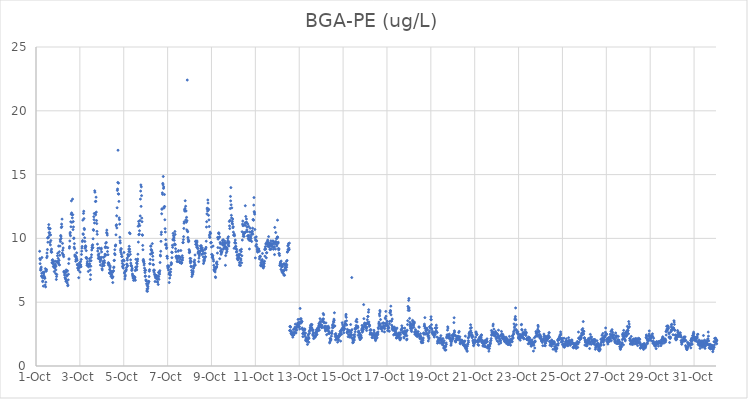
| Category | BGA-PE (ug/L) |
|---|---|
| 44470.166666666664 | 8.99 |
| 44470.177083333336 | 8.42 |
| 44470.1875 | 8.02 |
| 44470.197916666664 | 8.33 |
| 44470.208333333336 | 7.51 |
| 44470.21875 | 7.66 |
| 44470.229166666664 | 7.56 |
| 44470.239583333336 | 7.75 |
| 44470.25 | 7.05 |
| 44470.260416666664 | 7.27 |
| 44470.270833333336 | 8.5 |
| 44470.28125 | 7.02 |
| 44470.291666666664 | 6.93 |
| 44470.302083333336 | 6.61 |
| 44470.3125 | 6.67 |
| 44470.322916666664 | 7.36 |
| 44470.333333333336 | 6.26 |
| 44470.34375 | 7.24 |
| 44470.354166666664 | 7.11 |
| 44470.364583333336 | 6.92 |
| 44470.375 | 7.35 |
| 44470.385416666664 | 6.98 |
| 44470.395833333336 | 6.87 |
| 44470.40625 | 6.89 |
| 44470.416666666664 | 6.35 |
| 44470.427083333336 | 7.63 |
| 44470.4375 | 6.2 |
| 44470.447916666664 | 6.57 |
| 44470.458333333336 | 7.49 |
| 44470.46875 | 7.43 |
| 44470.479166666664 | 7.56 |
| 44470.489583333336 | 8.49 |
| 44470.5 | 8.85 |
| 44470.510416666664 | 8.61 |
| 44470.520833333336 | 9.13 |
| 44470.53125 | 10.03 |
| 44470.541666666664 | 9.7 |
| 44470.552083333336 | 10.07 |
| 44470.5625 | 10.06 |
| 44470.572916666664 | 10.84 |
| 44470.583333333336 | 11.08 |
| 44470.59375 | 10.45 |
| 44470.604166666664 | 10.73 |
| 44470.614583333336 | 10.25 |
| 44470.625 | 10.45 |
| 44470.635416666664 | 9.68 |
| 44470.645833333336 | 10.77 |
| 44470.65625 | 9.49 |
| 44470.666666666664 | 10.27 |
| 44470.677083333336 | 9.83 |
| 44470.6875 | 9.02 |
| 44470.697916666664 | 8.92 |
| 44470.708333333336 | 9.16 |
| 44470.71875 | 8.92 |
| 44470.729166666664 | 8.09 |
| 44470.739583333336 | 8.29 |
| 44470.75 | 8.09 |
| 44470.760416666664 | 8.33 |
| 44470.770833333336 | 8.12 |
| 44470.78125 | 8 |
| 44470.791666666664 | 7.8 |
| 44470.802083333336 | 8.17 |
| 44470.8125 | 7.78 |
| 44470.822916666664 | 7.75 |
| 44470.833333333336 | 7.4 |
| 44470.84375 | 7.9 |
| 44470.854166666664 | 7.67 |
| 44470.864583333336 | 7.71 |
| 44470.875 | 8.21 |
| 44470.885416666664 | 7.99 |
| 44470.895833333336 | 7.24 |
| 44470.90625 | 7.53 |
| 44470.916666666664 | 7.83 |
| 44470.927083333336 | 6.78 |
| 44470.9375 | 7.01 |
| 44470.947916666664 | 7.17 |
| 44470.958333333336 | 8.19 |
| 44470.96875 | 8.17 |
| 44470.979166666664 | 8.64 |
| 44470.989583333336 | 8.83 |
| 44471.0 | 8.1 |
| 44471.010416666664 | 8.43 |
| 44471.020833333336 | 8.13 |
| 44471.03125 | 9.4 |
| 44471.041666666664 | 7.98 |
| 44471.052083333336 | 8.28 |
| 44471.0625 | 8.95 |
| 44471.072916666664 | 7.92 |
| 44471.083333333336 | 8.68 |
| 44471.09375 | 9.4 |
| 44471.104166666664 | 9.89 |
| 44471.114583333336 | 9.75 |
| 44471.125 | 10.23 |
| 44471.135416666664 | 10.16 |
| 44471.145833333336 | 10 |
| 44471.15625 | 10.85 |
| 44471.166666666664 | 11.12 |
| 44471.177083333336 | 10.92 |
| 44471.1875 | 11.51 |
| 44471.197916666664 | 8.85 |
| 44471.208333333336 | 9.61 |
| 44471.21875 | 9.07 |
| 44471.229166666664 | 8.74 |
| 44471.239583333336 | 9.25 |
| 44471.25 | 8.7 |
| 44471.260416666664 | 8.57 |
| 44471.270833333336 | 7.41 |
| 44471.28125 | 7.33 |
| 44471.291666666664 | 7.39 |
| 44471.302083333336 | 7.13 |
| 44471.3125 | 7.35 |
| 44471.322916666664 | 6.93 |
| 44471.333333333336 | 7.31 |
| 44471.34375 | 6.87 |
| 44471.354166666664 | 6.78 |
| 44471.364583333336 | 6.63 |
| 44471.375 | 7.53 |
| 44471.385416666664 | 7.38 |
| 44471.395833333336 | 7.12 |
| 44471.40625 | 6.67 |
| 44471.416666666664 | 7.06 |
| 44471.427083333336 | 6.5 |
| 44471.4375 | 7.46 |
| 44471.447916666664 | 6.29 |
| 44471.458333333336 | 6.34 |
| 44471.46875 | 6.75 |
| 44471.479166666664 | 7.19 |
| 44471.489583333336 | 8.03 |
| 44471.5 | 8.38 |
| 44471.510416666664 | 8.39 |
| 44471.520833333336 | 9.24 |
| 44471.53125 | 9.36 |
| 44471.541666666664 | 9.8 |
| 44471.552083333336 | 10.35 |
| 44471.5625 | 10.47 |
| 44471.572916666664 | 10.21 |
| 44471.583333333336 | 11.3 |
| 44471.59375 | 10.91 |
| 44471.604166666664 | 11.9 |
| 44471.614583333336 | 12.94 |
| 44471.625 | 12 |
| 44471.635416666664 | 11.26 |
| 44471.645833333336 | 11.85 |
| 44471.65625 | 11.61 |
| 44471.666666666664 | 13.08 |
| 44471.677083333336 | 11.86 |
| 44471.6875 | 10.69 |
| 44471.697916666664 | 11.32 |
| 44471.708333333336 | 10.9 |
| 44471.71875 | 9.99 |
| 44471.729166666664 | 10.03 |
| 44471.739583333336 | 9.31 |
| 44471.75 | 9.59 |
| 44471.760416666664 | 9.19 |
| 44471.770833333336 | 8.7 |
| 44471.78125 | 8.59 |
| 44471.791666666664 | 8.66 |
| 44471.802083333336 | 8.59 |
| 44471.8125 | 8.21 |
| 44471.822916666664 | 8.35 |
| 44471.833333333336 | 8.57 |
| 44471.84375 | 8.46 |
| 44471.854166666664 | 8.87 |
| 44471.864583333336 | 8.38 |
| 44471.875 | 8.28 |
| 44471.885416666664 | 7.96 |
| 44471.895833333336 | 7.9 |
| 44471.90625 | 7.69 |
| 44471.916666666664 | 7.66 |
| 44471.927083333336 | 7.64 |
| 44471.9375 | 7.51 |
| 44471.947916666664 | 6.92 |
| 44471.958333333336 | 7.72 |
| 44471.96875 | 8.05 |
| 44471.979166666664 | 7.84 |
| 44471.989583333336 | 7.78 |
| 44472.0 | 7.74 |
| 44472.010416666664 | 7.36 |
| 44472.020833333336 | 7.94 |
| 44472.03125 | 8.17 |
| 44472.041666666664 | 7.92 |
| 44472.052083333336 | 7.78 |
| 44472.0625 | 8.35 |
| 44472.072916666664 | 8.74 |
| 44472.083333333336 | 9 |
| 44472.09375 | 9.24 |
| 44472.104166666664 | 9.37 |
| 44472.114583333336 | 9.75 |
| 44472.125 | 9.83 |
| 44472.135416666664 | 11.43 |
| 44472.145833333336 | 10.36 |
| 44472.15625 | 10.31 |
| 44472.166666666664 | 11.96 |
| 44472.177083333336 | 12.13 |
| 44472.1875 | 11.55 |
| 44472.197916666664 | 10.78 |
| 44472.208333333336 | 10.69 |
| 44472.21875 | 10.05 |
| 44472.229166666664 | 9.76 |
| 44472.239583333336 | 9.22 |
| 44472.25 | 9.31 |
| 44472.260416666664 | 9.42 |
| 44472.270833333336 | 9.35 |
| 44472.28125 | 8.49 |
| 44472.291666666664 | 9.04 |
| 44472.302083333336 | 8.5 |
| 44472.3125 | 8.41 |
| 44472.322916666664 | 7.89 |
| 44472.333333333336 | 8.06 |
| 44472.34375 | 8.19 |
| 44472.354166666664 | 8 |
| 44472.364583333336 | 7.86 |
| 44472.375 | 7.86 |
| 44472.385416666664 | 7.41 |
| 44472.395833333336 | 7.77 |
| 44472.40625 | 7.84 |
| 44472.416666666664 | 7.94 |
| 44472.427083333336 | 7.91 |
| 44472.4375 | 8.41 |
| 44472.447916666664 | 8.02 |
| 44472.458333333336 | 8.25 |
| 44472.46875 | 7.52 |
| 44472.479166666664 | 6.79 |
| 44472.489583333336 | 7.15 |
| 44472.5 | 7.82 |
| 44472.510416666664 | 8.25 |
| 44472.520833333336 | 8.52 |
| 44472.53125 | 8.72 |
| 44472.541666666664 | 9.09 |
| 44472.552083333336 | 9.28 |
| 44472.5625 | 9.43 |
| 44472.572916666664 | 9.25 |
| 44472.583333333336 | 9.5 |
| 44472.59375 | 9.28 |
| 44472.604166666664 | 9.97 |
| 44472.614583333336 | 10.69 |
| 44472.625 | 10.63 |
| 44472.635416666664 | 11.7 |
| 44472.645833333336 | 11.47 |
| 44472.65625 | 11.95 |
| 44472.666666666664 | 11.21 |
| 44472.677083333336 | 13.73 |
| 44472.6875 | 13.62 |
| 44472.697916666664 | 11.97 |
| 44472.708333333336 | 12.89 |
| 44472.71875 | 11.85 |
| 44472.729166666664 | 12.91 |
| 44472.739583333336 | 13.23 |
| 44472.75 | 12.06 |
| 44472.760416666664 | 11.4 |
| 44472.770833333336 | 11.16 |
| 44472.78125 | 10.55 |
| 44472.791666666664 | 10.32 |
| 44472.802083333336 | 9.55 |
| 44472.8125 | 9.01 |
| 44472.822916666664 | 9.22 |
| 44472.833333333336 | 8.7 |
| 44472.84375 | 8.43 |
| 44472.854166666664 | 8.43 |
| 44472.864583333336 | 8.57 |
| 44472.875 | 8.8 |
| 44472.885416666664 | 9.24 |
| 44472.895833333336 | 8.55 |
| 44472.90625 | 8.43 |
| 44472.916666666664 | 8.33 |
| 44472.927083333336 | 8.16 |
| 44472.9375 | 7.91 |
| 44472.947916666664 | 8.44 |
| 44472.958333333336 | 8.31 |
| 44472.96875 | 9.13 |
| 44472.979166666664 | 9.23 |
| 44472.989583333336 | 8.94 |
| 44473.0 | 8.52 |
| 44473.010416666664 | 7.62 |
| 44473.020833333336 | 7.53 |
| 44473.03125 | 7.82 |
| 44473.041666666664 | 8.01 |
| 44473.052083333336 | 7.99 |
| 44473.0625 | 8.2 |
| 44473.072916666664 | 8.06 |
| 44473.083333333336 | 8.51 |
| 44473.09375 | 8.17 |
| 44473.104166666664 | 7.88 |
| 44473.114583333336 | 8.26 |
| 44473.125 | 8.1 |
| 44473.135416666664 | 8.6 |
| 44473.145833333336 | 8.76 |
| 44473.15625 | 9.28 |
| 44473.166666666664 | 9.35 |
| 44473.177083333336 | 9.62 |
| 44473.1875 | 8.7 |
| 44473.197916666664 | 9.3 |
| 44473.208333333336 | 9.68 |
| 44473.21875 | 10.46 |
| 44473.229166666664 | 10.65 |
| 44473.239583333336 | 10.39 |
| 44473.25 | 10.26 |
| 44473.260416666664 | 8.97 |
| 44473.270833333336 | 9.27 |
| 44473.28125 | 8.72 |
| 44473.291666666664 | 8.02 |
| 44473.302083333336 | 8.1 |
| 44473.3125 | 7.89 |
| 44473.322916666664 | 8.04 |
| 44473.333333333336 | 7.97 |
| 44473.34375 | 7.29 |
| 44473.354166666664 | 7.56 |
| 44473.364583333336 | 7.27 |
| 44473.375 | 7.7 |
| 44473.385416666664 | 7.83 |
| 44473.395833333336 | 7.46 |
| 44473.40625 | 7.31 |
| 44473.416666666664 | 7.03 |
| 44473.427083333336 | 7.17 |
| 44473.4375 | 7.36 |
| 44473.447916666664 | 7.38 |
| 44473.458333333336 | 7.13 |
| 44473.46875 | 6.91 |
| 44473.479166666664 | 6.91 |
| 44473.489583333336 | 7.33 |
| 44473.5 | 6.54 |
| 44473.510416666664 | 6.99 |
| 44473.520833333336 | 7.42 |
| 44473.53125 | 7.47 |
| 44473.541666666664 | 7.71 |
| 44473.552083333336 | 7.76 |
| 44473.5625 | 8.26 |
| 44473.572916666664 | 8.28 |
| 44473.583333333336 | 8.81 |
| 44473.59375 | 9.11 |
| 44473.604166666664 | 8.72 |
| 44473.614583333336 | 9.41 |
| 44473.625 | 9.43 |
| 44473.635416666664 | 9.49 |
| 44473.645833333336 | 10.28 |
| 44473.65625 | 10.99 |
| 44473.666666666664 | 11.07 |
| 44473.677083333336 | 11.77 |
| 44473.6875 | 10.82 |
| 44473.697916666664 | 12.4 |
| 44473.708333333336 | 13.76 |
| 44473.71875 | 13.87 |
| 44473.729166666664 | 14.38 |
| 44473.739583333336 | 16.91 |
| 44473.75 | 13.49 |
| 44473.760416666664 | 14.33 |
| 44473.770833333336 | 13.47 |
| 44473.78125 | 12.9 |
| 44473.791666666664 | 11.61 |
| 44473.802083333336 | 11.47 |
| 44473.8125 | 11.12 |
| 44473.822916666664 | 10.09 |
| 44473.833333333336 | 9.81 |
| 44473.84375 | 9.65 |
| 44473.854166666664 | 9.08 |
| 44473.864583333336 | 8.93 |
| 44473.875 | 9.2 |
| 44473.885416666664 | 9.17 |
| 44473.895833333336 | 8.77 |
| 44473.90625 | 8.58 |
| 44473.916666666664 | 8.58 |
| 44473.927083333336 | 8.24 |
| 44473.9375 | 8.04 |
| 44473.947916666664 | 7.82 |
| 44473.958333333336 | 7.75 |
| 44473.96875 | 8.27 |
| 44473.979166666664 | 7.67 |
| 44473.989583333336 | 8.31 |
| 44474.0 | 7.91 |
| 44474.010416666664 | 8.9 |
| 44474.020833333336 | 8.24 |
| 44474.03125 | 7.28 |
| 44474.041666666664 | 7.35 |
| 44474.052083333336 | 6.82 |
| 44474.0625 | 7.01 |
| 44474.072916666664 | 7.12 |
| 44474.083333333336 | 7.44 |
| 44474.09375 | 7.46 |
| 44474.104166666664 | 7.46 |
| 44474.114583333336 | 7.57 |
| 44474.125 | 7.72 |
| 44474.135416666664 | 7.96 |
| 44474.145833333336 | 7.99 |
| 44474.15625 | 8.45 |
| 44474.166666666664 | 8.3 |
| 44474.177083333336 | 7.84 |
| 44474.1875 | 8.74 |
| 44474.197916666664 | 8.69 |
| 44474.208333333336 | 8.61 |
| 44474.21875 | 8.62 |
| 44474.229166666664 | 9.16 |
| 44474.239583333336 | 8.97 |
| 44474.25 | 9.38 |
| 44474.260416666664 | 10.44 |
| 44474.270833333336 | 9.16 |
| 44474.28125 | 8.96 |
| 44474.291666666664 | 10.37 |
| 44474.302083333336 | 8.75 |
| 44474.3125 | 8.32 |
| 44474.322916666664 | 8.06 |
| 44474.333333333336 | 7.86 |
| 44474.34375 | 7.89 |
| 44474.354166666664 | 7.81 |
| 44474.364583333336 | 7.48 |
| 44474.375 | 7.56 |
| 44474.385416666664 | 7.66 |
| 44474.395833333336 | 7.21 |
| 44474.40625 | 7.11 |
| 44474.416666666664 | 7.01 |
| 44474.427083333336 | 6.89 |
| 44474.4375 | 6.92 |
| 44474.447916666664 | 6.71 |
| 44474.458333333336 | 7.04 |
| 44474.46875 | 6.86 |
| 44474.479166666664 | 6.89 |
| 44474.489583333336 | 6.75 |
| 44474.5 | 6.99 |
| 44474.510416666664 | 6.93 |
| 44474.520833333336 | 7.48 |
| 44474.53125 | 6.72 |
| 44474.541666666664 | 7.74 |
| 44474.552083333336 | 8.36 |
| 44474.5625 | 7.56 |
| 44474.572916666664 | 7.68 |
| 44474.583333333336 | 8.07 |
| 44474.59375 | 7.53 |
| 44474.604166666664 | 7.8 |
| 44474.614583333336 | 8.01 |
| 44474.625 | 8.22 |
| 44474.635416666664 | 8.38 |
| 44474.645833333336 | 8.76 |
| 44474.65625 | 10.95 |
| 44474.666666666664 | 9.71 |
| 44474.677083333336 | 11.33 |
| 44474.6875 | 10.29 |
| 44474.697916666664 | 11.13 |
| 44474.708333333336 | 10.33 |
| 44474.71875 | 10.6 |
| 44474.729166666664 | 11 |
| 44474.739583333336 | 11.4 |
| 44474.75 | 11.76 |
| 44474.760416666664 | 13.08 |
| 44474.770833333336 | 13.71 |
| 44474.78125 | 14.19 |
| 44474.791666666664 | 12.51 |
| 44474.802083333336 | 14.04 |
| 44474.8125 | 13.35 |
| 44474.822916666664 | 11.59 |
| 44474.833333333336 | 11.31 |
| 44474.84375 | 10.28 |
| 44474.854166666664 | 10.24 |
| 44474.864583333336 | 9.45 |
| 44474.875 | 9.11 |
| 44474.885416666664 | 8.26 |
| 44474.895833333336 | 8.35 |
| 44474.90625 | 8.15 |
| 44474.916666666664 | 8.21 |
| 44474.927083333336 | 7.91 |
| 44474.9375 | 8.03 |
| 44474.947916666664 | 7.67 |
| 44474.958333333336 | 7.48 |
| 44474.96875 | 7.32 |
| 44474.979166666664 | 7.02 |
| 44474.989583333336 | 7.06 |
| 44475.0 | 7.5 |
| 44475.010416666664 | 6.75 |
| 44475.020833333336 | 6.71 |
| 44475.03125 | 6.65 |
| 44475.041666666664 | 6.44 |
| 44475.052083333336 | 5.88 |
| 44475.0625 | 6.04 |
| 44475.072916666664 | 6.3 |
| 44475.083333333336 | 5.85 |
| 44475.09375 | 6.06 |
| 44475.104166666664 | 6.21 |
| 44475.114583333336 | 6.44 |
| 44475.125 | 6.58 |
| 44475.135416666664 | 6.63 |
| 44475.145833333336 | 6.62 |
| 44475.15625 | 7.01 |
| 44475.166666666664 | 7.43 |
| 44475.177083333336 | 7.55 |
| 44475.1875 | 8.01 |
| 44475.197916666664 | 8.01 |
| 44475.208333333336 | 8.35 |
| 44475.21875 | 8.77 |
| 44475.229166666664 | 9.4 |
| 44475.239583333336 | 9.39 |
| 44475.25 | 9.13 |
| 44475.260416666664 | 9.07 |
| 44475.270833333336 | 9.05 |
| 44475.28125 | 8.81 |
| 44475.291666666664 | 8.85 |
| 44475.302083333336 | 9.59 |
| 44475.3125 | 8.89 |
| 44475.322916666664 | 8.6 |
| 44475.333333333336 | 8.31 |
| 44475.34375 | 7.95 |
| 44475.354166666664 | 7.94 |
| 44475.364583333336 | 7.46 |
| 44475.375 | 7.53 |
| 44475.385416666664 | 7.35 |
| 44475.395833333336 | 7.5 |
| 44475.40625 | 7.2 |
| 44475.416666666664 | 7.13 |
| 44475.427083333336 | 6.62 |
| 44475.4375 | 7.03 |
| 44475.447916666664 | 6.91 |
| 44475.458333333336 | 7.11 |
| 44475.46875 | 7.08 |
| 44475.479166666664 | 7.08 |
| 44475.489583333336 | 6.92 |
| 44475.5 | 6.87 |
| 44475.510416666664 | 7.07 |
| 44475.520833333336 | 6.81 |
| 44475.53125 | 6.62 |
| 44475.541666666664 | 6.56 |
| 44475.552083333336 | 6.83 |
| 44475.5625 | 7.06 |
| 44475.572916666664 | 6.39 |
| 44475.583333333336 | 7.33 |
| 44475.59375 | 7 |
| 44475.604166666664 | 6.79 |
| 44475.614583333336 | 7.31 |
| 44475.625 | 7.38 |
| 44475.635416666664 | 7.2 |
| 44475.645833333336 | 7.47 |
| 44475.65625 | 8.11 |
| 44475.666666666664 | 8.69 |
| 44475.677083333336 | 8.62 |
| 44475.6875 | 8.99 |
| 44475.697916666664 | 9.77 |
| 44475.708333333336 | 10.31 |
| 44475.71875 | 10.49 |
| 44475.729166666664 | 11.93 |
| 44475.739583333336 | 12.28 |
| 44475.75 | 12.33 |
| 44475.760416666664 | 13.57 |
| 44475.770833333336 | 13.45 |
| 44475.78125 | 14.31 |
| 44475.791666666664 | 14.2 |
| 44475.802083333336 | 14.85 |
| 44475.8125 | 13.92 |
| 44475.822916666664 | 14.03 |
| 44475.833333333336 | 12.38 |
| 44475.84375 | 12.48 |
| 44475.854166666664 | 13.44 |
| 44475.864583333336 | 12.5 |
| 44475.875 | 11.46 |
| 44475.885416666664 | 10.76 |
| 44475.895833333336 | 10.5 |
| 44475.90625 | 9.5 |
| 44475.916666666664 | 9.9 |
| 44475.927083333336 | 9.57 |
| 44475.9375 | 9.47 |
| 44475.947916666664 | 9.21 |
| 44475.958333333336 | 9.28 |
| 44475.96875 | 8.6 |
| 44475.979166666664 | 8.6 |
| 44475.989583333336 | 8.44 |
| 44476.0 | 7.83 |
| 44476.010416666664 | 7.68 |
| 44476.020833333336 | 7.86 |
| 44476.03125 | 7.73 |
| 44476.041666666664 | 7.52 |
| 44476.052083333336 | 7.81 |
| 44476.0625 | 7.2 |
| 44476.072916666664 | 6.54 |
| 44476.083333333336 | 7.3 |
| 44476.09375 | 6.89 |
| 44476.104166666664 | 7.29 |
| 44476.114583333336 | 7.15 |
| 44476.125 | 7.11 |
| 44476.135416666664 | 7.38 |
| 44476.145833333336 | 7.59 |
| 44476.15625 | 7.93 |
| 44476.166666666664 | 8.1 |
| 44476.177083333336 | 8.01 |
| 44476.1875 | 8.92 |
| 44476.197916666664 | 8.49 |
| 44476.208333333336 | 8.89 |
| 44476.21875 | 9.46 |
| 44476.229166666664 | 9.3 |
| 44476.239583333336 | 9.89 |
| 44476.25 | 10.39 |
| 44476.260416666664 | 9.89 |
| 44476.270833333336 | 10.21 |
| 44476.28125 | 10.01 |
| 44476.291666666664 | 10.1 |
| 44476.302083333336 | 9.85 |
| 44476.3125 | 9.5 |
| 44476.322916666664 | 9.57 |
| 44476.333333333336 | 10.54 |
| 44476.34375 | 10.31 |
| 44476.354166666664 | 9.51 |
| 44476.364583333336 | 9.19 |
| 44476.375 | 8.96 |
| 44476.385416666664 | 8.55 |
| 44476.395833333336 | 8.58 |
| 44476.40625 | 8.61 |
| 44476.416666666664 | 8.41 |
| 44476.427083333336 | 8.6 |
| 44476.4375 | 8.18 |
| 44476.447916666664 | 8.21 |
| 44476.458333333336 | 8.57 |
| 44476.46875 | 8.42 |
| 44476.479166666664 | 8.99 |
| 44476.489583333336 | 8.54 |
| 44476.5 | 9.05 |
| 44476.510416666664 | 8.61 |
| 44476.520833333336 | 8.56 |
| 44476.53125 | 8.19 |
| 44476.541666666664 | 8.16 |
| 44476.552083333336 | 8.12 |
| 44476.5625 | 8.11 |
| 44476.572916666664 | 8.37 |
| 44476.583333333336 | 8.14 |
| 44476.59375 | 8.51 |
| 44476.604166666664 | 9.05 |
| 44476.614583333336 | 8.1 |
| 44476.625 | 8.04 |
| 44476.635416666664 | 8.09 |
| 44476.645833333336 | 8.08 |
| 44476.65625 | 8.33 |
| 44476.666666666664 | 8.64 |
| 44476.677083333336 | 8.29 |
| 44476.6875 | 8.48 |
| 44476.697916666664 | 9.67 |
| 44476.708333333336 | 9.67 |
| 44476.71875 | 9.9 |
| 44476.729166666664 | 10.14 |
| 44476.739583333336 | 10.78 |
| 44476.75 | 11.19 |
| 44476.760416666664 | 11.31 |
| 44476.770833333336 | 12.24 |
| 44476.78125 | 12.14 |
| 44476.791666666664 | 12.34 |
| 44476.802083333336 | 12.95 |
| 44476.8125 | 12.16 |
| 44476.822916666664 | 12.52 |
| 44476.833333333336 | 11.46 |
| 44476.84375 | 12.15 |
| 44476.854166666664 | 11.27 |
| 44476.864583333336 | 11.65 |
| 44476.875 | 10.67 |
| 44476.885416666664 | 11.38 |
| 44476.895833333336 | 22.41 |
| 44476.90625 | 10.57 |
| 44476.916666666664 | 10.52 |
| 44476.927083333336 | 10.07 |
| 44476.9375 | 9.94 |
| 44476.947916666664 | 9.74 |
| 44476.958333333336 | 9.82 |
| 44476.96875 | 9.79 |
| 44476.979166666664 | 9.12 |
| 44476.989583333336 | 8.88 |
| 44477.0 | 9.02 |
| 44477.010416666664 | 8.93 |
| 44477.020833333336 | 8.43 |
| 44477.03125 | 8.22 |
| 44477.041666666664 | 8.08 |
| 44477.052083333336 | 8.42 |
| 44477.0625 | 7.81 |
| 44477.072916666664 | 8.2 |
| 44477.083333333336 | 7.78 |
| 44477.09375 | 7.49 |
| 44477.104166666664 | 7.01 |
| 44477.114583333336 | 7.33 |
| 44477.125 | 7.15 |
| 44477.135416666664 | 7.32 |
| 44477.145833333336 | 7.19 |
| 44477.15625 | 7.31 |
| 44477.166666666664 | 7.44 |
| 44477.177083333336 | 7.65 |
| 44477.1875 | 7.85 |
| 44477.197916666664 | 7.76 |
| 44477.208333333336 | 8.16 |
| 44477.21875 | 8.12 |
| 44477.229166666664 | 8.3 |
| 44477.239583333336 | 7.98 |
| 44477.25 | 8.7 |
| 44477.260416666664 | 7.9 |
| 44477.270833333336 | 9.75 |
| 44477.28125 | 9.53 |
| 44477.291666666664 | 9.8 |
| 44477.302083333336 | 9.55 |
| 44477.3125 | 9.73 |
| 44477.322916666664 | 9.32 |
| 44477.333333333336 | 9.66 |
| 44477.34375 | 9.79 |
| 44477.354166666664 | 9.46 |
| 44477.364583333336 | 9.3 |
| 44477.375 | 9.19 |
| 44477.385416666664 | 8.85 |
| 44477.395833333336 | 8.93 |
| 44477.40625 | 8.98 |
| 44477.416666666664 | 8.18 |
| 44477.427083333336 | 8.45 |
| 44477.4375 | 8.75 |
| 44477.447916666664 | 8.63 |
| 44477.458333333336 | 8.84 |
| 44477.46875 | 8.98 |
| 44477.479166666664 | 9.02 |
| 44477.489583333336 | 8.97 |
| 44477.5 | 9.41 |
| 44477.510416666664 | 9.22 |
| 44477.520833333336 | 9.38 |
| 44477.53125 | 9.43 |
| 44477.541666666664 | 9.24 |
| 44477.552083333336 | 9.12 |
| 44477.5625 | 8.74 |
| 44477.572916666664 | 9.09 |
| 44477.583333333336 | 9.25 |
| 44477.59375 | 9.06 |
| 44477.604166666664 | 8.82 |
| 44477.614583333336 | 9.01 |
| 44477.625 | 8.55 |
| 44477.635416666664 | 8.03 |
| 44477.645833333336 | 8.3 |
| 44477.65625 | 8.17 |
| 44477.666666666664 | 8.82 |
| 44477.677083333336 | 8.26 |
| 44477.6875 | 8.4 |
| 44477.697916666664 | 9.13 |
| 44477.708333333336 | 8.56 |
| 44477.71875 | 8.84 |
| 44477.729166666664 | 8.56 |
| 44477.739583333336 | 9.18 |
| 44477.75 | 9.3 |
| 44477.760416666664 | 9.78 |
| 44477.770833333336 | 10.89 |
| 44477.78125 | 11.31 |
| 44477.791666666664 | 11.92 |
| 44477.802083333336 | 12.37 |
| 44477.8125 | 12.27 |
| 44477.822916666664 | 12.14 |
| 44477.833333333336 | 13.01 |
| 44477.84375 | 12.77 |
| 44477.854166666664 | 12.31 |
| 44477.864583333336 | 11.81 |
| 44477.875 | 12.25 |
| 44477.885416666664 | 11.45 |
| 44477.895833333336 | 10.93 |
| 44477.90625 | 10.26 |
| 44477.916666666664 | 10.11 |
| 44477.927083333336 | 10.07 |
| 44477.9375 | 10.49 |
| 44477.947916666664 | 10.39 |
| 44477.958333333336 | 10.39 |
| 44477.96875 | 9.65 |
| 44477.979166666664 | 9.67 |
| 44477.989583333336 | 9.67 |
| 44478.0 | 9.32 |
| 44478.010416666664 | 8.75 |
| 44478.020833333336 | 8.72 |
| 44478.03125 | 8.5 |
| 44478.041666666664 | 8.61 |
| 44478.052083333336 | 8.52 |
| 44478.0625 | 8.64 |
| 44478.072916666664 | 9.4 |
| 44478.083333333336 | 8.37 |
| 44478.09375 | 8.22 |
| 44478.104166666664 | 7.89 |
| 44478.114583333336 | 7.56 |
| 44478.125 | 7.47 |
| 44478.135416666664 | 7.73 |
| 44478.145833333336 | 7.46 |
| 44478.15625 | 7.5 |
| 44478.166666666664 | 7.37 |
| 44478.177083333336 | 6.99 |
| 44478.1875 | 6.93 |
| 44478.197916666664 | 7.63 |
| 44478.208333333336 | 7.73 |
| 44478.21875 | 8.06 |
| 44478.229166666664 | 7.77 |
| 44478.239583333336 | 7.76 |
| 44478.25 | 8.16 |
| 44478.260416666664 | 7.96 |
| 44478.270833333336 | 8.85 |
| 44478.28125 | 10.08 |
| 44478.291666666664 | 9.28 |
| 44478.302083333336 | 9.94 |
| 44478.3125 | 10.07 |
| 44478.322916666664 | 10.39 |
| 44478.333333333336 | 10.44 |
| 44478.34375 | 10.37 |
| 44478.354166666664 | 10.06 |
| 44478.364583333336 | 10.13 |
| 44478.375 | 8.41 |
| 44478.385416666664 | 9.25 |
| 44478.395833333336 | 9.68 |
| 44478.40625 | 9.58 |
| 44478.416666666664 | 9 |
| 44478.427083333336 | 9 |
| 44478.4375 | 8.75 |
| 44478.447916666664 | 8.85 |
| 44478.458333333336 | 8.89 |
| 44478.46875 | 9.13 |
| 44478.479166666664 | 8.95 |
| 44478.489583333336 | 9.54 |
| 44478.5 | 9.83 |
| 44478.510416666664 | 9.69 |
| 44478.520833333336 | 9.47 |
| 44478.53125 | 9.9 |
| 44478.541666666664 | 9.15 |
| 44478.552083333336 | 9.49 |
| 44478.5625 | 9.65 |
| 44478.572916666664 | 9.26 |
| 44478.583333333336 | 9.51 |
| 44478.59375 | 9.31 |
| 44478.604166666664 | 9.79 |
| 44478.614583333336 | 9.63 |
| 44478.625 | 9.39 |
| 44478.635416666664 | 7.89 |
| 44478.645833333336 | 8.65 |
| 44478.65625 | 9.62 |
| 44478.666666666664 | 9.15 |
| 44478.677083333336 | 8.87 |
| 44478.6875 | 9.29 |
| 44478.697916666664 | 9.23 |
| 44478.708333333336 | 8.99 |
| 44478.71875 | 9.16 |
| 44478.729166666664 | 9.72 |
| 44478.739583333336 | 10.01 |
| 44478.75 | 9.84 |
| 44478.760416666664 | 9.49 |
| 44478.770833333336 | 10.13 |
| 44478.78125 | 9.59 |
| 44478.791666666664 | 9.4 |
| 44478.802083333336 | 9.71 |
| 44478.8125 | 11.33 |
| 44478.822916666664 | 10.98 |
| 44478.833333333336 | 10.77 |
| 44478.84375 | 11.41 |
| 44478.854166666664 | 12.34 |
| 44478.864583333336 | 13.29 |
| 44478.875 | 12.94 |
| 44478.885416666664 | 13.98 |
| 44478.895833333336 | 12.63 |
| 44478.90625 | 11.81 |
| 44478.916666666664 | 11.6 |
| 44478.927083333336 | 12.39 |
| 44478.9375 | 11.2 |
| 44478.947916666664 | 11.34 |
| 44478.958333333336 | 11.13 |
| 44478.96875 | 11.52 |
| 44478.979166666664 | 10.84 |
| 44478.989583333336 | 10.92 |
| 44479.0 | 10.49 |
| 44479.010416666664 | 10.25 |
| 44479.020833333336 | 10.26 |
| 44479.03125 | 9.22 |
| 44479.041666666664 | 10.33 |
| 44479.052083333336 | 10.21 |
| 44479.0625 | 9.65 |
| 44479.072916666664 | 9.68 |
| 44479.083333333336 | 9.87 |
| 44479.09375 | 9.36 |
| 44479.104166666664 | 9.62 |
| 44479.114583333336 | 9.37 |
| 44479.125 | 9.18 |
| 44479.135416666664 | 8.93 |
| 44479.145833333336 | 9.13 |
| 44479.15625 | 8.97 |
| 44479.166666666664 | 8.66 |
| 44479.177083333336 | 8.44 |
| 44479.1875 | 8.71 |
| 44479.197916666664 | 8.35 |
| 44479.208333333336 | 8.31 |
| 44479.21875 | 8.38 |
| 44479.229166666664 | 8.49 |
| 44479.239583333336 | 8.62 |
| 44479.25 | 8.49 |
| 44479.260416666664 | 8.77 |
| 44479.270833333336 | 7.9 |
| 44479.28125 | 8.08 |
| 44479.291666666664 | 8.13 |
| 44479.302083333336 | 9.07 |
| 44479.3125 | 8.73 |
| 44479.322916666664 | 7.88 |
| 44479.333333333336 | 8.41 |
| 44479.34375 | 8.3 |
| 44479.354166666664 | 8.96 |
| 44479.364583333336 | 9.15 |
| 44479.375 | 8.09 |
| 44479.385416666664 | 8.64 |
| 44479.395833333336 | 10.52 |
| 44479.40625 | 9.87 |
| 44479.416666666664 | 11.12 |
| 44479.427083333336 | 11.36 |
| 44479.4375 | 10.99 |
| 44479.447916666664 | 10.17 |
| 44479.458333333336 | 10.32 |
| 44479.46875 | 10.36 |
| 44479.479166666664 | 10.46 |
| 44479.489583333336 | 10.16 |
| 44479.5 | 11.04 |
| 44479.510416666664 | 10.42 |
| 44479.520833333336 | 10.43 |
| 44479.53125 | 11.22 |
| 44479.541666666664 | 12.56 |
| 44479.552083333336 | 11.02 |
| 44479.5625 | 11.72 |
| 44479.572916666664 | 10.52 |
| 44479.583333333336 | 11.26 |
| 44479.59375 | 11.52 |
| 44479.604166666664 | 11.25 |
| 44479.614583333336 | 10.67 |
| 44479.625 | 10.89 |
| 44479.635416666664 | 10.54 |
| 44479.645833333336 | 10.18 |
| 44479.65625 | 11.12 |
| 44479.666666666664 | 10.21 |
| 44479.677083333336 | 9.98 |
| 44479.6875 | 9.99 |
| 44479.697916666664 | 10.94 |
| 44479.708333333336 | 10.23 |
| 44479.71875 | 9.85 |
| 44479.729166666664 | 9.17 |
| 44479.739583333336 | 10.5 |
| 44479.75 | 10.02 |
| 44479.760416666664 | 10.8 |
| 44479.770833333336 | 9.84 |
| 44479.78125 | 9.84 |
| 44479.791666666664 | 10.15 |
| 44479.802083333336 | 10 |
| 44479.8125 | 10.5 |
| 44479.822916666664 | 10.31 |
| 44479.833333333336 | 9.76 |
| 44479.84375 | 10.36 |
| 44479.854166666664 | 10.58 |
| 44479.864583333336 | 10.51 |
| 44479.875 | 10.8 |
| 44479.885416666664 | 10.33 |
| 44479.895833333336 | 11.46 |
| 44479.90625 | 11.48 |
| 44479.916666666664 | 11.42 |
| 44479.927083333336 | 12.61 |
| 44479.9375 | 13.2 |
| 44479.947916666664 | 12.1 |
| 44479.958333333336 | 12.02 |
| 44479.96875 | 11.9 |
| 44479.979166666664 | 10.7 |
| 44479.989583333336 | 10.06 |
| 44480.0 | 8.47 |
| 44480.010416666664 | 9.88 |
| 44480.020833333336 | 9.41 |
| 44480.03125 | 9.86 |
| 44480.041666666664 | 10.12 |
| 44480.052083333336 | 9.53 |
| 44480.0625 | 9.8 |
| 44480.072916666664 | 9.33 |
| 44480.083333333336 | 9.16 |
| 44480.09375 | 9.01 |
| 44480.104166666664 | 8.92 |
| 44480.114583333336 | 9.08 |
| 44480.125 | 8.99 |
| 44480.135416666664 | 9.12 |
| 44480.145833333336 | 9.17 |
| 44480.15625 | 9.17 |
| 44480.166666666664 | 9 |
| 44480.177083333336 | 9.01 |
| 44480.1875 | 8.39 |
| 44480.197916666664 | 8.55 |
| 44480.208333333336 | 8.54 |
| 44480.21875 | 8.61 |
| 44480.229166666664 | 8.58 |
| 44480.239583333336 | 7.89 |
| 44480.25 | 8.08 |
| 44480.260416666664 | 7.83 |
| 44480.270833333336 | 7.94 |
| 44480.28125 | 8.26 |
| 44480.291666666664 | 7.93 |
| 44480.302083333336 | 8.21 |
| 44480.3125 | 8.34 |
| 44480.322916666664 | 8.82 |
| 44480.333333333336 | 7.82 |
| 44480.34375 | 7.77 |
| 44480.354166666664 | 8.07 |
| 44480.364583333336 | 7.68 |
| 44480.375 | 7.93 |
| 44480.385416666664 | 8.17 |
| 44480.395833333336 | 7.8 |
| 44480.40625 | 8.05 |
| 44480.416666666664 | 8.21 |
| 44480.427083333336 | 9.12 |
| 44480.4375 | 8.61 |
| 44480.447916666664 | 9.21 |
| 44480.458333333336 | 9.35 |
| 44480.46875 | 9.15 |
| 44480.479166666664 | 9.56 |
| 44480.489583333336 | 9.61 |
| 44480.5 | 8.48 |
| 44480.510416666664 | 8.87 |
| 44480.520833333336 | 8.88 |
| 44480.53125 | 9.59 |
| 44480.541666666664 | 9.76 |
| 44480.552083333336 | 9.4 |
| 44480.5625 | 9.87 |
| 44480.572916666664 | 9.58 |
| 44480.583333333336 | 9.71 |
| 44480.59375 | 9.65 |
| 44480.604166666664 | 10.14 |
| 44480.614583333336 | 9.65 |
| 44480.625 | 9.32 |
| 44480.635416666664 | 9.44 |
| 44480.645833333336 | 9.56 |
| 44480.65625 | 9.44 |
| 44480.666666666664 | 9.15 |
| 44480.677083333336 | 9.13 |
| 44480.6875 | 9.48 |
| 44480.697916666664 | 9.63 |
| 44480.708333333336 | 9.81 |
| 44480.71875 | 9.37 |
| 44480.729166666664 | 9.17 |
| 44480.739583333336 | 9.55 |
| 44480.75 | 9.56 |
| 44480.760416666664 | 9.46 |
| 44480.770833333336 | 9.52 |
| 44480.78125 | 9.56 |
| 44480.791666666664 | 9.79 |
| 44480.802083333336 | 9.33 |
| 44480.8125 | 9.79 |
| 44480.822916666664 | 9.15 |
| 44480.833333333336 | 9.74 |
| 44480.84375 | 9.63 |
| 44480.854166666664 | 9.3 |
| 44480.864583333336 | 9.35 |
| 44480.875 | 8.73 |
| 44480.885416666664 | 10.86 |
| 44480.895833333336 | 9.57 |
| 44480.90625 | 9.72 |
| 44480.916666666664 | 9.16 |
| 44480.927083333336 | 10.46 |
| 44480.9375 | 9.75 |
| 44480.947916666664 | 9.7 |
| 44480.958333333336 | 9.98 |
| 44480.96875 | 9.51 |
| 44480.979166666664 | 9.41 |
| 44480.989583333336 | 10.01 |
| 44481.0 | 10.11 |
| 44481.010416666664 | 11.43 |
| 44481.020833333336 | 10.1 |
| 44481.03125 | 9.61 |
| 44481.041666666664 | 9.7 |
| 44481.052083333336 | 9.21 |
| 44481.0625 | 9.1 |
| 44481.072916666664 | 8.81 |
| 44481.083333333336 | 9.17 |
| 44481.09375 | 8.81 |
| 44481.104166666664 | 8.66 |
| 44481.114583333336 | 7.88 |
| 44481.125 | 7.91 |
| 44481.135416666664 | 8.05 |
| 44481.145833333336 | 8.15 |
| 44481.15625 | 8.01 |
| 44481.166666666664 | 7.57 |
| 44481.177083333336 | 8.22 |
| 44481.1875 | 7.87 |
| 44481.197916666664 | 7.75 |
| 44481.208333333336 | 7.38 |
| 44481.21875 | 7.49 |
| 44481.229166666664 | 7.91 |
| 44481.239583333336 | 7.81 |
| 44481.25 | 7.43 |
| 44481.260416666664 | 7.29 |
| 44481.270833333336 | 7.25 |
| 44481.28125 | 8 |
| 44481.291666666664 | 7.46 |
| 44481.302083333336 | 7.12 |
| 44481.3125 | 7.5 |
| 44481.322916666664 | 8.01 |
| 44481.333333333336 | 7.11 |
| 44481.34375 | 7.94 |
| 44481.354166666664 | 7.67 |
| 44481.364583333336 | 7.73 |
| 44481.375 | 7.92 |
| 44481.385416666664 | 7.76 |
| 44481.395833333336 | 8.01 |
| 44481.40625 | 7.53 |
| 44481.416666666664 | 8.2 |
| 44481.427083333336 | 7.74 |
| 44481.4375 | 7.92 |
| 44481.447916666664 | 8.27 |
| 44481.458333333336 | 8.92 |
| 44481.46875 | 8.97 |
| 44481.479166666664 | 9.41 |
| 44481.489583333336 | 9.13 |
| 44481.5 | 9.46 |
| 44481.510416666664 | 9.59 |
| 44481.520833333336 | 9.09 |
| 44481.53125 | 9.24 |
| 44481.541666666664 | 9.12 |
| 44481.552083333336 | 9.63 |
| 44481.5625 | 2.78 |
| 44481.572916666664 | 3.09 |
| 44481.583333333336 | 2.78 |
| 44481.59375 | 3.1 |
| 44481.604166666664 | 3.04 |
| 44481.614583333336 | 2.71 |
| 44481.625 | 2.57 |
| 44481.635416666664 | 2.52 |
| 44481.645833333336 | 2.73 |
| 44481.65625 | 2.55 |
| 44481.666666666664 | 2.44 |
| 44481.677083333336 | 2.57 |
| 44481.6875 | 2.42 |
| 44481.697916666664 | 2.5 |
| 44481.708333333336 | 2.26 |
| 44481.71875 | 2.58 |
| 44481.729166666664 | 2.41 |
| 44481.739583333336 | 2.87 |
| 44481.75 | 2.62 |
| 44481.760416666664 | 2.45 |
| 44481.770833333336 | 2.87 |
| 44481.78125 | 2.6 |
| 44481.791666666664 | 2.94 |
| 44481.802083333336 | 3.04 |
| 44481.8125 | 2.65 |
| 44481.822916666664 | 3.28 |
| 44481.833333333336 | 2.87 |
| 44481.84375 | 2.88 |
| 44481.854166666664 | 2.59 |
| 44481.864583333336 | 2.92 |
| 44481.875 | 3.03 |
| 44481.885416666664 | 2.8 |
| 44481.895833333336 | 3.06 |
| 44481.90625 | 3.23 |
| 44481.916666666664 | 3.23 |
| 44481.927083333336 | 3.29 |
| 44481.9375 | 3.38 |
| 44481.947916666664 | 3.65 |
| 44481.958333333336 | 3.16 |
| 44481.96875 | 3.1 |
| 44481.979166666664 | 3.07 |
| 44481.989583333336 | 3.23 |
| 44482.0 | 3.44 |
| 44482.010416666664 | 3.08 |
| 44482.020833333336 | 2.9 |
| 44482.03125 | 3.37 |
| 44482.041666666664 | 4.51 |
| 44482.052083333336 | 3.68 |
| 44482.0625 | 3.37 |
| 44482.072916666664 | 3.66 |
| 44482.083333333336 | 3.71 |
| 44482.09375 | 3.38 |
| 44482.104166666664 | 3.47 |
| 44482.114583333336 | 3.48 |
| 44482.125 | 3.49 |
| 44482.135416666664 | 2.98 |
| 44482.145833333336 | 2.9 |
| 44482.15625 | 2.54 |
| 44482.166666666664 | 2.3 |
| 44482.177083333336 | 2.81 |
| 44482.1875 | 2.54 |
| 44482.197916666664 | 2.64 |
| 44482.208333333336 | 2.57 |
| 44482.21875 | 2.54 |
| 44482.229166666664 | 2.9 |
| 44482.239583333336 | 2.8 |
| 44482.25 | 2.35 |
| 44482.260416666664 | 2.89 |
| 44482.270833333336 | 2.54 |
| 44482.28125 | 2.59 |
| 44482.291666666664 | 2 |
| 44482.302083333336 | 2.05 |
| 44482.3125 | 2.14 |
| 44482.322916666664 | 2.22 |
| 44482.333333333336 | 1.95 |
| 44482.34375 | 2.07 |
| 44482.354166666664 | 1.93 |
| 44482.364583333336 | 2 |
| 44482.375 | 1.69 |
| 44482.385416666664 | 2.05 |
| 44482.395833333336 | 2.09 |
| 44482.40625 | 2.39 |
| 44482.416666666664 | 2.48 |
| 44482.427083333336 | 2.25 |
| 44482.4375 | 1.86 |
| 44482.447916666664 | 2.17 |
| 44482.458333333336 | 2.71 |
| 44482.46875 | 2.57 |
| 44482.479166666664 | 2.78 |
| 44482.489583333336 | 2.82 |
| 44482.5 | 3.03 |
| 44482.510416666664 | 2.96 |
| 44482.520833333336 | 3.2 |
| 44482.53125 | 3.16 |
| 44482.541666666664 | 3.16 |
| 44482.552083333336 | 3.26 |
| 44482.5625 | 3.02 |
| 44482.572916666664 | 2.97 |
| 44482.583333333336 | 3.24 |
| 44482.59375 | 2.78 |
| 44482.604166666664 | 2.84 |
| 44482.614583333336 | 2.43 |
| 44482.625 | 2.51 |
| 44482.635416666664 | 2.82 |
| 44482.645833333336 | 2.62 |
| 44482.65625 | 2.15 |
| 44482.666666666664 | 2.34 |
| 44482.677083333336 | 2.2 |
| 44482.6875 | 2.31 |
| 44482.697916666664 | 2.38 |
| 44482.708333333336 | 2.26 |
| 44482.71875 | 2.27 |
| 44482.729166666664 | 2.28 |
| 44482.739583333336 | 2.55 |
| 44482.75 | 2.64 |
| 44482.760416666664 | 2.38 |
| 44482.770833333336 | 2.41 |
| 44482.78125 | 2.84 |
| 44482.791666666664 | 2.71 |
| 44482.802083333336 | 2.68 |
| 44482.8125 | 2.48 |
| 44482.822916666664 | 2.76 |
| 44482.833333333336 | 2.94 |
| 44482.84375 | 2.96 |
| 44482.854166666664 | 2.97 |
| 44482.864583333336 | 2.77 |
| 44482.875 | 2.9 |
| 44482.885416666664 | 3.13 |
| 44482.895833333336 | 3.33 |
| 44482.90625 | 3.21 |
| 44482.916666666664 | 2.81 |
| 44482.927083333336 | 3.04 |
| 44482.9375 | 3.2 |
| 44482.947916666664 | 3.71 |
| 44482.958333333336 | 3.49 |
| 44482.96875 | 3.44 |
| 44482.979166666664 | 3.27 |
| 44482.989583333336 | 3.15 |
| 44483.0 | 3.13 |
| 44483.010416666664 | 3.1 |
| 44483.020833333336 | 3.01 |
| 44483.03125 | 3.01 |
| 44483.041666666664 | 3.19 |
| 44483.052083333336 | 3.49 |
| 44483.0625 | 3.63 |
| 44483.072916666664 | 3.58 |
| 44483.083333333336 | 3.69 |
| 44483.09375 | 4.11 |
| 44483.104166666664 | 3.69 |
| 44483.114583333336 | 4.01 |
| 44483.125 | 3.45 |
| 44483.135416666664 | 3.38 |
| 44483.145833333336 | 3.01 |
| 44483.15625 | 3.09 |
| 44483.166666666664 | 2.99 |
| 44483.177083333336 | 2.91 |
| 44483.1875 | 3.11 |
| 44483.197916666664 | 2.74 |
| 44483.208333333336 | 2.79 |
| 44483.21875 | 3.38 |
| 44483.229166666664 | 3.06 |
| 44483.239583333336 | 3.07 |
| 44483.25 | 2.45 |
| 44483.260416666664 | 2.98 |
| 44483.270833333336 | 2.86 |
| 44483.28125 | 3.04 |
| 44483.291666666664 | 2.84 |
| 44483.302083333336 | 2.8 |
| 44483.3125 | 2.79 |
| 44483.322916666664 | 3.12 |
| 44483.333333333336 | 2.55 |
| 44483.34375 | 3.02 |
| 44483.354166666664 | 2.95 |
| 44483.364583333336 | 2.68 |
| 44483.375 | 2.54 |
| 44483.385416666664 | 1.81 |
| 44483.395833333336 | 1.88 |
| 44483.40625 | 2.15 |
| 44483.416666666664 | 2.13 |
| 44483.427083333336 | 1.99 |
| 44483.4375 | 2.13 |
| 44483.447916666664 | 2.05 |
| 44483.458333333336 | 2.59 |
| 44483.46875 | 2.34 |
| 44483.479166666664 | 2.57 |
| 44483.489583333336 | 2.55 |
| 44483.5 | 2.75 |
| 44483.510416666664 | 3.01 |
| 44483.520833333336 | 3.18 |
| 44483.53125 | 3.26 |
| 44483.541666666664 | 3.12 |
| 44483.552083333336 | 3.02 |
| 44483.5625 | 3.49 |
| 44483.572916666664 | 3.42 |
| 44483.583333333336 | 3.67 |
| 44483.59375 | 3.57 |
| 44483.604166666664 | 4.17 |
| 44483.614583333336 | 3.13 |
| 44483.625 | 3.14 |
| 44483.635416666664 | 2.47 |
| 44483.645833333336 | 2.31 |
| 44483.65625 | 2.05 |
| 44483.666666666664 | 2.54 |
| 44483.677083333336 | 2.42 |
| 44483.6875 | 2.22 |
| 44483.697916666664 | 2.1 |
| 44483.708333333336 | 2.35 |
| 44483.71875 | 2.28 |
| 44483.729166666664 | 2.28 |
| 44483.739583333336 | 2.26 |
| 44483.75 | 1.87 |
| 44483.760416666664 | 2.15 |
| 44483.770833333336 | 2.09 |
| 44483.78125 | 2.23 |
| 44483.791666666664 | 2.03 |
| 44483.802083333336 | 2.27 |
| 44483.8125 | 2.4 |
| 44483.822916666664 | 2.32 |
| 44483.833333333336 | 2.5 |
| 44483.84375 | 2.38 |
| 44483.854166666664 | 2.43 |
| 44483.864583333336 | 2.7 |
| 44483.875 | 2.54 |
| 44483.885416666664 | 1.95 |
| 44483.895833333336 | 2.78 |
| 44483.90625 | 2.58 |
| 44483.916666666664 | 2.78 |
| 44483.927083333336 | 2.48 |
| 44483.9375 | 2.88 |
| 44483.947916666664 | 2.8 |
| 44483.958333333336 | 3.39 |
| 44483.96875 | 2.94 |
| 44483.979166666664 | 3.22 |
| 44483.989583333336 | 3.04 |
| 44484.0 | 2.93 |
| 44484.010416666664 | 3.03 |
| 44484.020833333336 | 2.78 |
| 44484.03125 | 2.6 |
| 44484.041666666664 | 2.85 |
| 44484.052083333336 | 2.94 |
| 44484.0625 | 3.14 |
| 44484.072916666664 | 2.93 |
| 44484.083333333336 | 3.31 |
| 44484.09375 | 3.48 |
| 44484.104166666664 | 3.32 |
| 44484.114583333336 | 3.31 |
| 44484.125 | 3.92 |
| 44484.135416666664 | 4.05 |
| 44484.145833333336 | 3.81 |
| 44484.15625 | 3.54 |
| 44484.166666666664 | 3.22 |
| 44484.177083333336 | 2.6 |
| 44484.1875 | 2.66 |
| 44484.197916666664 | 2.87 |
| 44484.208333333336 | 2.68 |
| 44484.21875 | 2.75 |
| 44484.229166666664 | 2.29 |
| 44484.239583333336 | 2.77 |
| 44484.25 | 2.45 |
| 44484.260416666664 | 2.72 |
| 44484.270833333336 | 2.78 |
| 44484.28125 | 2.46 |
| 44484.291666666664 | 2.69 |
| 44484.302083333336 | 2.76 |
| 44484.3125 | 2.25 |
| 44484.322916666664 | 2.32 |
| 44484.333333333336 | 2.47 |
| 44484.34375 | 3.25 |
| 44484.354166666664 | 2.36 |
| 44484.364583333336 | 2.62 |
| 44484.375 | 2.77 |
| 44484.385416666664 | 2.45 |
| 44484.395833333336 | 6.93 |
| 44484.40625 | 2.85 |
| 44484.416666666664 | 2.17 |
| 44484.427083333336 | 2.2 |
| 44484.4375 | 1.82 |
| 44484.447916666664 | 1.96 |
| 44484.458333333336 | 2.07 |
| 44484.46875 | 1.85 |
| 44484.479166666664 | 2.43 |
| 44484.489583333336 | 2.01 |
| 44484.5 | 2.19 |
| 44484.510416666664 | 2.04 |
| 44484.520833333336 | 2.29 |
| 44484.53125 | 2.46 |
| 44484.541666666664 | 2.94 |
| 44484.552083333336 | 2.68 |
| 44484.5625 | 2.87 |
| 44484.572916666664 | 2.95 |
| 44484.583333333336 | 3.51 |
| 44484.59375 | 3.17 |
| 44484.604166666664 | 3.05 |
| 44484.614583333336 | 3.06 |
| 44484.625 | 3.66 |
| 44484.635416666664 | 3.45 |
| 44484.645833333336 | 3.04 |
| 44484.65625 | 2.99 |
| 44484.666666666664 | 3.12 |
| 44484.677083333336 | 3.04 |
| 44484.6875 | 2.4 |
| 44484.697916666664 | 2.66 |
| 44484.708333333336 | 2.74 |
| 44484.71875 | 2.59 |
| 44484.729166666664 | 2.64 |
| 44484.739583333336 | 2.22 |
| 44484.75 | 2.24 |
| 44484.760416666664 | 2.55 |
| 44484.770833333336 | 2.06 |
| 44484.78125 | 2.46 |
| 44484.791666666664 | 2.34 |
| 44484.802083333336 | 2.16 |
| 44484.8125 | 2.39 |
| 44484.822916666664 | 2.18 |
| 44484.833333333336 | 2.25 |
| 44484.84375 | 2.81 |
| 44484.854166666664 | 2.91 |
| 44484.864583333336 | 3.18 |
| 44484.875 | 2.65 |
| 44484.885416666664 | 3 |
| 44484.895833333336 | 2.73 |
| 44484.90625 | 3.08 |
| 44484.916666666664 | 2.98 |
| 44484.927083333336 | 2.86 |
| 44484.9375 | 4.81 |
| 44484.947916666664 | 3.71 |
| 44484.958333333336 | 3.07 |
| 44484.96875 | 3.26 |
| 44484.979166666664 | 3.34 |
| 44484.989583333336 | 3.37 |
| 44485.0 | 3.18 |
| 44485.010416666664 | 3.3 |
| 44485.020833333336 | 3.27 |
| 44485.03125 | 3.25 |
| 44485.041666666664 | 3 |
| 44485.052083333336 | 3.05 |
| 44485.0625 | 2.93 |
| 44485.072916666664 | 2.78 |
| 44485.083333333336 | 3.03 |
| 44485.09375 | 3.31 |
| 44485.104166666664 | 3.63 |
| 44485.114583333336 | 3.41 |
| 44485.125 | 3.88 |
| 44485.135416666664 | 3.88 |
| 44485.145833333336 | 3.3 |
| 44485.15625 | 4.22 |
| 44485.166666666664 | 4.41 |
| 44485.177083333336 | 3.45 |
| 44485.1875 | 3.26 |
| 44485.197916666664 | 3.11 |
| 44485.208333333336 | 3.19 |
| 44485.21875 | 2.81 |
| 44485.229166666664 | 2.48 |
| 44485.239583333336 | 2.59 |
| 44485.25 | 2.81 |
| 44485.260416666664 | 2.84 |
| 44485.270833333336 | 2.83 |
| 44485.28125 | 2.59 |
| 44485.291666666664 | 2.54 |
| 44485.302083333336 | 2.48 |
| 44485.3125 | 2.47 |
| 44485.322916666664 | 2.22 |
| 44485.333333333336 | 2.25 |
| 44485.34375 | 2.5 |
| 44485.354166666664 | 2.49 |
| 44485.364583333336 | 2.41 |
| 44485.375 | 2.4 |
| 44485.385416666664 | 2.47 |
| 44485.395833333336 | 2.46 |
| 44485.40625 | 2.8 |
| 44485.416666666664 | 2.65 |
| 44485.427083333336 | 2.46 |
| 44485.4375 | 2.18 |
| 44485.447916666664 | 2.16 |
| 44485.458333333336 | 2.36 |
| 44485.46875 | 2.3 |
| 44485.479166666664 | 1.99 |
| 44485.489583333336 | 2.13 |
| 44485.5 | 2.13 |
| 44485.510416666664 | 2.52 |
| 44485.520833333336 | 2.49 |
| 44485.53125 | 2.36 |
| 44485.541666666664 | 2.6 |
| 44485.552083333336 | 2.21 |
| 44485.5625 | 2.56 |
| 44485.572916666664 | 2.55 |
| 44485.583333333336 | 2.46 |
| 44485.59375 | 2.67 |
| 44485.604166666664 | 3.01 |
| 44485.614583333336 | 2.92 |
| 44485.625 | 3.3 |
| 44485.635416666664 | 3.44 |
| 44485.645833333336 | 3.16 |
| 44485.65625 | 4.08 |
| 44485.666666666664 | 3.93 |
| 44485.677083333336 | 4.35 |
| 44485.6875 | 4.24 |
| 44485.697916666664 | 3.28 |
| 44485.708333333336 | 3.64 |
| 44485.71875 | 2.95 |
| 44485.729166666664 | 3.1 |
| 44485.739583333336 | 2.99 |
| 44485.75 | 2.9 |
| 44485.760416666664 | 3.02 |
| 44485.770833333336 | 2.97 |
| 44485.78125 | 2.74 |
| 44485.791666666664 | 3.35 |
| 44485.802083333336 | 3.06 |
| 44485.8125 | 3.03 |
| 44485.822916666664 | 3.07 |
| 44485.833333333336 | 3.35 |
| 44485.84375 | 3.38 |
| 44485.854166666664 | 2.99 |
| 44485.864583333336 | 3.17 |
| 44485.875 | 2.97 |
| 44485.885416666664 | 2.67 |
| 44485.895833333336 | 2.93 |
| 44485.90625 | 3.11 |
| 44485.916666666664 | 3.76 |
| 44485.927083333336 | 3.34 |
| 44485.9375 | 3.7 |
| 44485.947916666664 | 4.28 |
| 44485.958333333336 | 3.9 |
| 44485.96875 | 3.24 |
| 44485.979166666664 | 3.19 |
| 44485.989583333336 | 3.32 |
| 44486.0 | 3.53 |
| 44486.010416666664 | 3.17 |
| 44486.020833333336 | 3.46 |
| 44486.03125 | 2.77 |
| 44486.041666666664 | 2.93 |
| 44486.052083333336 | 3.14 |
| 44486.0625 | 3 |
| 44486.072916666664 | 3 |
| 44486.083333333336 | 3.02 |
| 44486.09375 | 2.74 |
| 44486.104166666664 | 2.73 |
| 44486.114583333336 | 3.3 |
| 44486.125 | 3.49 |
| 44486.135416666664 | 4.17 |
| 44486.145833333336 | 4.18 |
| 44486.15625 | 4.35 |
| 44486.166666666664 | 4.31 |
| 44486.177083333336 | 4.69 |
| 44486.1875 | 4.01 |
| 44486.197916666664 | 3.54 |
| 44486.208333333336 | 3.51 |
| 44486.21875 | 3.19 |
| 44486.229166666664 | 2.9 |
| 44486.239583333336 | 3.68 |
| 44486.25 | 3.08 |
| 44486.260416666664 | 3.05 |
| 44486.270833333336 | 2.8 |
| 44486.28125 | 2.92 |
| 44486.291666666664 | 2.84 |
| 44486.302083333336 | 2.44 |
| 44486.3125 | 2.82 |
| 44486.322916666664 | 2.89 |
| 44486.333333333336 | 3.05 |
| 44486.34375 | 2.81 |
| 44486.354166666664 | 2.54 |
| 44486.364583333336 | 2.73 |
| 44486.375 | 2.96 |
| 44486.385416666664 | 2.43 |
| 44486.395833333336 | 2.71 |
| 44486.40625 | 2.58 |
| 44486.416666666664 | 2.85 |
| 44486.427083333336 | 2.19 |
| 44486.4375 | 2.53 |
| 44486.447916666664 | 2.21 |
| 44486.458333333336 | 2.97 |
| 44486.46875 | 2.38 |
| 44486.479166666664 | 2.34 |
| 44486.489583333336 | 2.26 |
| 44486.5 | 2.53 |
| 44486.510416666664 | 2.35 |
| 44486.520833333336 | 2.33 |
| 44486.53125 | 2.4 |
| 44486.541666666664 | 2.59 |
| 44486.552083333336 | 2.47 |
| 44486.5625 | 2.28 |
| 44486.572916666664 | 2.14 |
| 44486.583333333336 | 2.59 |
| 44486.59375 | 2.04 |
| 44486.604166666664 | 2.08 |
| 44486.614583333336 | 2.45 |
| 44486.625 | 2.61 |
| 44486.635416666664 | 2.2 |
| 44486.645833333336 | 2.83 |
| 44486.65625 | 2.83 |
| 44486.666666666664 | 2.87 |
| 44486.677083333336 | 3.15 |
| 44486.6875 | 2.94 |
| 44486.697916666664 | 2.99 |
| 44486.708333333336 | 2.95 |
| 44486.71875 | 2.68 |
| 44486.729166666664 | 2.63 |
| 44486.739583333336 | 2.65 |
| 44486.75 | 2.56 |
| 44486.760416666664 | 2.68 |
| 44486.770833333336 | 2.27 |
| 44486.78125 | 2.19 |
| 44486.791666666664 | 2.57 |
| 44486.802083333336 | 2.49 |
| 44486.8125 | 2.97 |
| 44486.822916666664 | 2.76 |
| 44486.833333333336 | 2.67 |
| 44486.84375 | 2.65 |
| 44486.854166666664 | 2.39 |
| 44486.864583333336 | 2.52 |
| 44486.875 | 2.74 |
| 44486.885416666664 | 2.68 |
| 44486.895833333336 | 2.05 |
| 44486.90625 | 2.38 |
| 44486.916666666664 | 2.11 |
| 44486.927083333336 | 2.8 |
| 44486.9375 | 3.25 |
| 44486.947916666664 | 3.55 |
| 44486.958333333336 | 4.67 |
| 44486.96875 | 4.36 |
| 44486.979166666664 | 4.53 |
| 44486.989583333336 | 5.14 |
| 44487.0 | 5.29 |
| 44487.010416666664 | 4.55 |
| 44487.020833333336 | 4.36 |
| 44487.03125 | 3.73 |
| 44487.041666666664 | 3.42 |
| 44487.052083333336 | 3.2 |
| 44487.0625 | 3.08 |
| 44487.072916666664 | 2.94 |
| 44487.083333333336 | 3.2 |
| 44487.09375 | 3.32 |
| 44487.104166666664 | 2.79 |
| 44487.114583333336 | 3.06 |
| 44487.125 | 2.7 |
| 44487.135416666664 | 3.02 |
| 44487.145833333336 | 2.94 |
| 44487.15625 | 3.24 |
| 44487.166666666664 | 3.58 |
| 44487.177083333336 | 3.49 |
| 44487.1875 | 3.24 |
| 44487.197916666664 | 3.21 |
| 44487.208333333336 | 3.21 |
| 44487.21875 | 3.41 |
| 44487.229166666664 | 3.03 |
| 44487.239583333336 | 3.33 |
| 44487.25 | 3.44 |
| 44487.260416666664 | 2.66 |
| 44487.270833333336 | 2.48 |
| 44487.28125 | 2.59 |
| 44487.291666666664 | 2.7 |
| 44487.302083333336 | 2.85 |
| 44487.3125 | 2.5 |
| 44487.322916666664 | 2.47 |
| 44487.333333333336 | 2.48 |
| 44487.34375 | 2.37 |
| 44487.354166666664 | 2.35 |
| 44487.364583333336 | 2.7 |
| 44487.375 | 2.6 |
| 44487.385416666664 | 2.54 |
| 44487.395833333336 | 2.31 |
| 44487.40625 | 2.4 |
| 44487.416666666664 | 2.46 |
| 44487.427083333336 | 2.69 |
| 44487.4375 | 2.43 |
| 44487.447916666664 | 2.44 |
| 44487.458333333336 | 3.07 |
| 44487.46875 | 3.03 |
| 44487.479166666664 | 2.39 |
| 44487.489583333336 | 2.27 |
| 44487.5 | 2.15 |
| 44487.510416666664 | 2.31 |
| 44487.520833333336 | 2.17 |
| 44487.53125 | 2.53 |
| 44487.541666666664 | 2.33 |
| 44487.552083333336 | 2.25 |
| 44487.5625 | 1.92 |
| 44487.572916666664 | 1.83 |
| 44487.583333333336 | 1.94 |
| 44487.59375 | 2.1 |
| 44487.604166666664 | 1.85 |
| 44487.614583333336 | 1.85 |
| 44487.625 | 2.05 |
| 44487.635416666664 | 1.83 |
| 44487.645833333336 | 2.02 |
| 44487.65625 | 2.19 |
| 44487.666666666664 | 2.57 |
| 44487.677083333336 | 2.58 |
| 44487.6875 | 2.48 |
| 44487.697916666664 | 3.12 |
| 44487.708333333336 | 3.28 |
| 44487.71875 | 3.13 |
| 44487.729166666664 | 3.79 |
| 44487.739583333336 | 2.95 |
| 44487.75 | 2.97 |
| 44487.760416666664 | 2.5 |
| 44487.770833333336 | 2.76 |
| 44487.78125 | 2.95 |
| 44487.791666666664 | 2.74 |
| 44487.802083333336 | 2.58 |
| 44487.8125 | 2.86 |
| 44487.822916666664 | 2.97 |
| 44487.833333333336 | 2.51 |
| 44487.84375 | 2.85 |
| 44487.854166666664 | 2.44 |
| 44487.864583333336 | 2.5 |
| 44487.875 | 2.31 |
| 44487.885416666664 | 1.96 |
| 44487.895833333336 | 2.38 |
| 44487.90625 | 2.13 |
| 44487.916666666664 | 2.21 |
| 44487.927083333336 | 2.63 |
| 44487.9375 | 2.75 |
| 44487.947916666664 | 3.08 |
| 44487.958333333336 | 3.09 |
| 44487.96875 | 3 |
| 44487.979166666664 | 3.03 |
| 44487.989583333336 | 2.98 |
| 44488.0 | 3.64 |
| 44488.010416666664 | 3.86 |
| 44488.020833333336 | 3.63 |
| 44488.03125 | 3.24 |
| 44488.041666666664 | 2.9 |
| 44488.052083333336 | 2.92 |
| 44488.0625 | 2.59 |
| 44488.072916666664 | 2.73 |
| 44488.083333333336 | 2.61 |
| 44488.09375 | 2.48 |
| 44488.104166666664 | 2.52 |
| 44488.114583333336 | 2.51 |
| 44488.125 | 2.59 |
| 44488.135416666664 | 2.44 |
| 44488.145833333336 | 2.36 |
| 44488.15625 | 2.27 |
| 44488.166666666664 | 2.6 |
| 44488.177083333336 | 2.55 |
| 44488.1875 | 2.64 |
| 44488.197916666664 | 2.46 |
| 44488.208333333336 | 2.99 |
| 44488.21875 | 2.97 |
| 44488.229166666664 | 2.74 |
| 44488.239583333336 | 2.94 |
| 44488.25 | 3.2 |
| 44488.260416666664 | 2.71 |
| 44488.270833333336 | 3 |
| 44488.28125 | 2.27 |
| 44488.291666666664 | 2.62 |
| 44488.302083333336 | 1.79 |
| 44488.3125 | 1.93 |
| 44488.322916666664 | 2.01 |
| 44488.333333333336 | 1.89 |
| 44488.34375 | 1.9 |
| 44488.354166666664 | 2.18 |
| 44488.364583333336 | 2.04 |
| 44488.375 | 2.12 |
| 44488.385416666664 | 2.07 |
| 44488.395833333336 | 2.18 |
| 44488.40625 | 2.05 |
| 44488.416666666664 | 1.8 |
| 44488.427083333336 | 2.03 |
| 44488.4375 | 2.2 |
| 44488.447916666664 | 2.08 |
| 44488.458333333336 | 2.38 |
| 44488.46875 | 2.07 |
| 44488.479166666664 | 1.98 |
| 44488.489583333336 | 2.05 |
| 44488.5 | 1.91 |
| 44488.510416666664 | 1.8 |
| 44488.520833333336 | 1.68 |
| 44488.53125 | 1.87 |
| 44488.541666666664 | 1.87 |
| 44488.552083333336 | 2.15 |
| 44488.5625 | 1.83 |
| 44488.572916666664 | 1.61 |
| 44488.583333333336 | 1.41 |
| 44488.59375 | 1.82 |
| 44488.604166666664 | 1.98 |
| 44488.614583333336 | 1.41 |
| 44488.625 | 1.52 |
| 44488.635416666664 | 1.51 |
| 44488.645833333336 | 1.26 |
| 44488.65625 | 1.25 |
| 44488.666666666664 | 1.55 |
| 44488.677083333336 | 1.51 |
| 44488.6875 | 1.26 |
| 44488.697916666664 | 1.81 |
| 44488.708333333336 | 1.69 |
| 44488.71875 | 2.21 |
| 44488.729166666664 | 2.32 |
| 44488.739583333336 | 2.43 |
| 44488.75 | 2.44 |
| 44488.760416666664 | 2.81 |
| 44488.770833333336 | 3.07 |
| 44488.78125 | 2.97 |
| 44488.791666666664 | 2.33 |
| 44488.802083333336 | 2.19 |
| 44488.8125 | 2.3 |
| 44488.822916666664 | 2.42 |
| 44488.833333333336 | 2.19 |
| 44488.84375 | 2.5 |
| 44488.854166666664 | 2.36 |
| 44488.864583333336 | 2.19 |
| 44488.875 | 2.18 |
| 44488.885416666664 | 2.17 |
| 44488.895833333336 | 2.04 |
| 44488.90625 | 1.92 |
| 44488.916666666664 | 1.62 |
| 44488.927083333336 | 1.73 |
| 44488.9375 | 1.97 |
| 44488.947916666664 | 1.91 |
| 44488.958333333336 | 2.03 |
| 44488.96875 | 2.41 |
| 44488.979166666664 | 2.16 |
| 44488.989583333336 | 2.35 |
| 44489.0 | 2.22 |
| 44489.010416666664 | 2.32 |
| 44489.020833333336 | 2.14 |
| 44489.03125 | 2.46 |
| 44489.041666666664 | 2.54 |
| 44489.052083333336 | 3.4 |
| 44489.0625 | 3.78 |
| 44489.072916666664 | 2.76 |
| 44489.083333333336 | 2.66 |
| 44489.09375 | 2.43 |
| 44489.104166666664 | 1.97 |
| 44489.114583333336 | 2.37 |
| 44489.125 | 1.92 |
| 44489.135416666664 | 1.88 |
| 44489.145833333336 | 2.36 |
| 44489.15625 | 2.02 |
| 44489.166666666664 | 2.01 |
| 44489.177083333336 | 2.16 |
| 44489.1875 | 2.17 |
| 44489.197916666664 | 2.27 |
| 44489.208333333336 | 2.23 |
| 44489.21875 | 2.31 |
| 44489.229166666664 | 2.27 |
| 44489.239583333336 | 2.34 |
| 44489.25 | 2.05 |
| 44489.260416666664 | 2.2 |
| 44489.270833333336 | 2.62 |
| 44489.28125 | 2.29 |
| 44489.291666666664 | 2.71 |
| 44489.302083333336 | 2.09 |
| 44489.3125 | 2.1 |
| 44489.322916666664 | 2.29 |
| 44489.333333333336 | 1.79 |
| 44489.34375 | 1.74 |
| 44489.354166666664 | 1.88 |
| 44489.364583333336 | 1.96 |
| 44489.375 | 1.83 |
| 44489.385416666664 | 1.82 |
| 44489.395833333336 | 1.84 |
| 44489.40625 | 2.01 |
| 44489.416666666664 | 2.03 |
| 44489.427083333336 | 1.95 |
| 44489.4375 | 1.88 |
| 44489.447916666664 | 1.86 |
| 44489.458333333336 | 1.78 |
| 44489.46875 | 1.67 |
| 44489.479166666664 | 1.79 |
| 44489.489583333336 | 1.62 |
| 44489.5 | 1.92 |
| 44489.510416666664 | 1.86 |
| 44489.520833333336 | 1.92 |
| 44489.53125 | 1.66 |
| 44489.541666666664 | 1.52 |
| 44489.552083333336 | 1.96 |
| 44489.5625 | 1.65 |
| 44489.572916666664 | 2.34 |
| 44489.583333333336 | 1.44 |
| 44489.59375 | 1.35 |
| 44489.604166666664 | 1.4 |
| 44489.614583333336 | 1.51 |
| 44489.625 | 1.52 |
| 44489.635416666664 | 1.36 |
| 44489.645833333336 | 1.22 |
| 44489.65625 | 1.15 |
| 44489.666666666664 | 1.55 |
| 44489.677083333336 | 1.72 |
| 44489.6875 | 1.7 |
| 44489.697916666664 | 2.21 |
| 44489.708333333336 | 1.99 |
| 44489.71875 | 1.86 |
| 44489.729166666664 | 2.24 |
| 44489.739583333336 | 2.52 |
| 44489.75 | 2.38 |
| 44489.760416666664 | 2.64 |
| 44489.770833333336 | 2.62 |
| 44489.78125 | 2.63 |
| 44489.791666666664 | 2.43 |
| 44489.802083333336 | 2.95 |
| 44489.8125 | 3.23 |
| 44489.822916666664 | 2.75 |
| 44489.833333333336 | 2.99 |
| 44489.84375 | 3 |
| 44489.854166666664 | 2.61 |
| 44489.864583333336 | 2.33 |
| 44489.875 | 2.45 |
| 44489.885416666664 | 2.21 |
| 44489.895833333336 | 2.28 |
| 44489.90625 | 2.34 |
| 44489.916666666664 | 2.01 |
| 44489.927083333336 | 1.91 |
| 44489.9375 | 1.81 |
| 44489.947916666664 | 1.59 |
| 44489.958333333336 | 1.64 |
| 44489.96875 | 1.77 |
| 44489.979166666664 | 1.74 |
| 44489.989583333336 | 2.05 |
| 44490.0 | 1.87 |
| 44490.010416666664 | 1.9 |
| 44490.020833333336 | 1.91 |
| 44490.03125 | 2.01 |
| 44490.041666666664 | 2.26 |
| 44490.052083333336 | 2.65 |
| 44490.0625 | 2.67 |
| 44490.072916666664 | 2.57 |
| 44490.083333333336 | 2.49 |
| 44490.09375 | 2.44 |
| 44490.104166666664 | 2.46 |
| 44490.114583333336 | 1.89 |
| 44490.125 | 1.98 |
| 44490.135416666664 | 1.95 |
| 44490.145833333336 | 1.68 |
| 44490.15625 | 1.87 |
| 44490.166666666664 | 2.09 |
| 44490.177083333336 | 1.62 |
| 44490.1875 | 1.93 |
| 44490.197916666664 | 1.99 |
| 44490.208333333336 | 2.05 |
| 44490.21875 | 2.26 |
| 44490.229166666664 | 2.21 |
| 44490.239583333336 | 1.97 |
| 44490.25 | 2.12 |
| 44490.260416666664 | 2.09 |
| 44490.270833333336 | 2.34 |
| 44490.28125 | 2.21 |
| 44490.291666666664 | 2.27 |
| 44490.302083333336 | 2.44 |
| 44490.3125 | 2.42 |
| 44490.322916666664 | 1.85 |
| 44490.333333333336 | 2.04 |
| 44490.34375 | 1.91 |
| 44490.354166666664 | 1.88 |
| 44490.364583333336 | 1.78 |
| 44490.375 | 1.6 |
| 44490.385416666664 | 1.55 |
| 44490.395833333336 | 1.94 |
| 44490.40625 | 1.81 |
| 44490.416666666664 | 1.72 |
| 44490.427083333336 | 1.57 |
| 44490.4375 | 1.85 |
| 44490.447916666664 | 1.88 |
| 44490.458333333336 | 1.98 |
| 44490.46875 | 1.77 |
| 44490.479166666664 | 1.51 |
| 44490.489583333336 | 1.53 |
| 44490.5 | 1.95 |
| 44490.510416666664 | 2.01 |
| 44490.520833333336 | 1.82 |
| 44490.53125 | 2.02 |
| 44490.541666666664 | 1.95 |
| 44490.552083333336 | 1.92 |
| 44490.5625 | 2.13 |
| 44490.572916666664 | 1.92 |
| 44490.583333333336 | 1.42 |
| 44490.59375 | 1.43 |
| 44490.604166666664 | 1.56 |
| 44490.614583333336 | 1.62 |
| 44490.625 | 1.52 |
| 44490.635416666664 | 1.45 |
| 44490.645833333336 | 1.16 |
| 44490.65625 | 1.38 |
| 44490.666666666664 | 1.36 |
| 44490.677083333336 | 1.6 |
| 44490.6875 | 1.56 |
| 44490.697916666664 | 1.82 |
| 44490.708333333336 | 1.72 |
| 44490.71875 | 1.79 |
| 44490.729166666664 | 1.98 |
| 44490.739583333336 | 2.01 |
| 44490.75 | 2.15 |
| 44490.760416666664 | 2.78 |
| 44490.770833333336 | 2.41 |
| 44490.78125 | 2.49 |
| 44490.791666666664 | 2.62 |
| 44490.802083333336 | 2.67 |
| 44490.8125 | 2.45 |
| 44490.822916666664 | 2.68 |
| 44490.833333333336 | 3.14 |
| 44490.84375 | 3.28 |
| 44490.854166666664 | 2.57 |
| 44490.864583333336 | 2.48 |
| 44490.875 | 2.89 |
| 44490.885416666664 | 2.4 |
| 44490.895833333336 | 2.58 |
| 44490.90625 | 2.36 |
| 44490.916666666664 | 2.37 |
| 44490.927083333336 | 2.38 |
| 44490.9375 | 2.53 |
| 44490.947916666664 | 2.71 |
| 44490.958333333336 | 2.58 |
| 44490.96875 | 2.58 |
| 44490.979166666664 | 2.14 |
| 44490.989583333336 | 2.26 |
| 44491.0 | 2.55 |
| 44491.010416666664 | 2.22 |
| 44491.020833333336 | 1.98 |
| 44491.03125 | 2.52 |
| 44491.041666666664 | 2.25 |
| 44491.052083333336 | 2.44 |
| 44491.0625 | 1.91 |
| 44491.072916666664 | 2.36 |
| 44491.083333333336 | 2.81 |
| 44491.09375 | 2.26 |
| 44491.104166666664 | 1.72 |
| 44491.114583333336 | 2.2 |
| 44491.125 | 2.32 |
| 44491.135416666664 | 2.12 |
| 44491.145833333336 | 2.06 |
| 44491.15625 | 1.96 |
| 44491.166666666664 | 1.94 |
| 44491.177083333336 | 2 |
| 44491.1875 | 1.81 |
| 44491.197916666664 | 2.35 |
| 44491.208333333336 | 2.44 |
| 44491.21875 | 2.71 |
| 44491.229166666664 | 2.47 |
| 44491.239583333336 | 2.5 |
| 44491.25 | 2.21 |
| 44491.260416666664 | 2.49 |
| 44491.270833333336 | 2.16 |
| 44491.28125 | 2.46 |
| 44491.291666666664 | 2.15 |
| 44491.302083333336 | 2.34 |
| 44491.3125 | 2.32 |
| 44491.322916666664 | 2.15 |
| 44491.333333333336 | 2.26 |
| 44491.34375 | 1.99 |
| 44491.354166666664 | 2.09 |
| 44491.364583333336 | 1.92 |
| 44491.375 | 2.11 |
| 44491.385416666664 | 1.88 |
| 44491.395833333336 | 2.08 |
| 44491.40625 | 2.13 |
| 44491.416666666664 | 2.04 |
| 44491.427083333336 | 2.26 |
| 44491.4375 | 2.02 |
| 44491.447916666664 | 1.76 |
| 44491.458333333336 | 1.93 |
| 44491.46875 | 2.14 |
| 44491.479166666664 | 2.11 |
| 44491.489583333336 | 1.88 |
| 44491.5 | 1.99 |
| 44491.510416666664 | 2.03 |
| 44491.520833333336 | 1.67 |
| 44491.53125 | 1.83 |
| 44491.541666666664 | 1.92 |
| 44491.552083333336 | 1.76 |
| 44491.5625 | 1.7 |
| 44491.572916666664 | 1.81 |
| 44491.583333333336 | 2.32 |
| 44491.59375 | 1.84 |
| 44491.604166666664 | 1.97 |
| 44491.614583333336 | 1.95 |
| 44491.625 | 2.09 |
| 44491.635416666664 | 1.63 |
| 44491.645833333336 | 1.86 |
| 44491.65625 | 2.08 |
| 44491.666666666664 | 1.93 |
| 44491.677083333336 | 2.11 |
| 44491.6875 | 2.09 |
| 44491.697916666664 | 1.95 |
| 44491.708333333336 | 1.9 |
| 44491.71875 | 2.36 |
| 44491.729166666664 | 2.37 |
| 44491.739583333336 | 2.17 |
| 44491.75 | 2.21 |
| 44491.760416666664 | 2.48 |
| 44491.770833333336 | 2.67 |
| 44491.78125 | 2.51 |
| 44491.791666666664 | 3.3 |
| 44491.802083333336 | 2.79 |
| 44491.8125 | 3 |
| 44491.822916666664 | 3.11 |
| 44491.833333333336 | 3.64 |
| 44491.84375 | 3.74 |
| 44491.854166666664 | 3.88 |
| 44491.864583333336 | 4.55 |
| 44491.875 | 3.62 |
| 44491.885416666664 | 2.86 |
| 44491.895833333336 | 3.23 |
| 44491.90625 | 2.8 |
| 44491.916666666664 | 2.66 |
| 44491.927083333336 | 2.59 |
| 44491.9375 | 2.7 |
| 44491.947916666664 | 2.69 |
| 44491.958333333336 | 2.57 |
| 44491.96875 | 2.68 |
| 44491.979166666664 | 2.46 |
| 44491.989583333336 | 2.26 |
| 44492.0 | 2.16 |
| 44492.010416666664 | 2.19 |
| 44492.020833333336 | 2.23 |
| 44492.03125 | 2.27 |
| 44492.041666666664 | 2.13 |
| 44492.052083333336 | 2.48 |
| 44492.0625 | 2.27 |
| 44492.072916666664 | 2.02 |
| 44492.083333333336 | 2.41 |
| 44492.09375 | 2.42 |
| 44492.104166666664 | 2.2 |
| 44492.114583333336 | 2.34 |
| 44492.125 | 3.23 |
| 44492.135416666664 | 3.26 |
| 44492.145833333336 | 2.86 |
| 44492.15625 | 2.81 |
| 44492.166666666664 | 2.29 |
| 44492.177083333336 | 2.46 |
| 44492.1875 | 2.54 |
| 44492.197916666664 | 2.23 |
| 44492.208333333336 | 2.63 |
| 44492.21875 | 2.45 |
| 44492.229166666664 | 2.2 |
| 44492.239583333336 | 2.12 |
| 44492.25 | 2.54 |
| 44492.260416666664 | 2.52 |
| 44492.270833333336 | 2.62 |
| 44492.28125 | 2.53 |
| 44492.291666666664 | 2.59 |
| 44492.302083333336 | 2.83 |
| 44492.3125 | 2.47 |
| 44492.322916666664 | 2.44 |
| 44492.333333333336 | 2.39 |
| 44492.34375 | 2.65 |
| 44492.354166666664 | 2.59 |
| 44492.364583333336 | 2.11 |
| 44492.375 | 2.13 |
| 44492.385416666664 | 2.06 |
| 44492.395833333336 | 2.07 |
| 44492.40625 | 2.19 |
| 44492.416666666664 | 2.17 |
| 44492.427083333336 | 2.13 |
| 44492.4375 | 1.74 |
| 44492.447916666664 | 2 |
| 44492.458333333336 | 2.26 |
| 44492.46875 | 2.25 |
| 44492.479166666664 | 1.78 |
| 44492.489583333336 | 2.01 |
| 44492.5 | 1.81 |
| 44492.510416666664 | 2.19 |
| 44492.520833333336 | 1.83 |
| 44492.53125 | 2 |
| 44492.541666666664 | 1.84 |
| 44492.552083333336 | 1.87 |
| 44492.5625 | 1.68 |
| 44492.572916666664 | 1.55 |
| 44492.583333333336 | 1.59 |
| 44492.59375 | 1.87 |
| 44492.604166666664 | 1.74 |
| 44492.614583333336 | 2.05 |
| 44492.625 | 1.66 |
| 44492.635416666664 | 1.87 |
| 44492.645833333336 | 1.83 |
| 44492.65625 | 1.86 |
| 44492.666666666664 | 1.65 |
| 44492.677083333336 | 1.17 |
| 44492.6875 | 1.86 |
| 44492.697916666664 | 1.63 |
| 44492.708333333336 | 1.83 |
| 44492.71875 | 2.21 |
| 44492.729166666664 | 1.9 |
| 44492.739583333336 | 1.41 |
| 44492.75 | 1.89 |
| 44492.760416666664 | 1.95 |
| 44492.770833333336 | 2.3 |
| 44492.78125 | 2.33 |
| 44492.791666666664 | 2.7 |
| 44492.802083333336 | 2.58 |
| 44492.8125 | 2.65 |
| 44492.822916666664 | 2.61 |
| 44492.833333333336 | 2.47 |
| 44492.84375 | 2.68 |
| 44492.854166666664 | 2.34 |
| 44492.864583333336 | 2.59 |
| 44492.875 | 2.88 |
| 44492.885416666664 | 3.19 |
| 44492.895833333336 | 3.07 |
| 44492.90625 | 2.73 |
| 44492.916666666664 | 2.71 |
| 44492.927083333336 | 2.38 |
| 44492.9375 | 2.69 |
| 44492.947916666664 | 2.43 |
| 44492.958333333336 | 2.24 |
| 44492.96875 | 2.47 |
| 44492.979166666664 | 2.18 |
| 44492.989583333336 | 2.39 |
| 44493.0 | 2.2 |
| 44493.010416666664 | 2.13 |
| 44493.020833333336 | 2.19 |
| 44493.03125 | 2.28 |
| 44493.041666666664 | 1.97 |
| 44493.052083333336 | 1.96 |
| 44493.0625 | 1.98 |
| 44493.072916666664 | 2.05 |
| 44493.083333333336 | 1.84 |
| 44493.09375 | 2.05 |
| 44493.104166666664 | 1.59 |
| 44493.114583333336 | 2.04 |
| 44493.125 | 2.04 |
| 44493.135416666664 | 2.01 |
| 44493.145833333336 | 2.12 |
| 44493.15625 | 2.5 |
| 44493.166666666664 | 2.28 |
| 44493.177083333336 | 2.38 |
| 44493.1875 | 1.61 |
| 44493.197916666664 | 1.96 |
| 44493.208333333336 | 1.8 |
| 44493.21875 | 1.59 |
| 44493.229166666664 | 2.15 |
| 44493.239583333336 | 1.79 |
| 44493.25 | 2.32 |
| 44493.260416666664 | 2.25 |
| 44493.270833333336 | 1.97 |
| 44493.28125 | 2.06 |
| 44493.291666666664 | 2.1 |
| 44493.302083333336 | 2.03 |
| 44493.3125 | 2.12 |
| 44493.322916666664 | 2.13 |
| 44493.333333333336 | 2.18 |
| 44493.34375 | 2.36 |
| 44493.354166666664 | 2.32 |
| 44493.364583333336 | 2.4 |
| 44493.375 | 2.2 |
| 44493.385416666664 | 2.59 |
| 44493.395833333336 | 2.62 |
| 44493.40625 | 1.92 |
| 44493.416666666664 | 2.25 |
| 44493.427083333336 | 1.63 |
| 44493.4375 | 1.9 |
| 44493.447916666664 | 1.93 |
| 44493.458333333336 | 1.85 |
| 44493.46875 | 1.78 |
| 44493.479166666664 | 1.79 |
| 44493.489583333336 | 1.69 |
| 44493.5 | 1.55 |
| 44493.510416666664 | 2.04 |
| 44493.520833333336 | 1.93 |
| 44493.53125 | 1.86 |
| 44493.541666666664 | 1.77 |
| 44493.552083333336 | 1.7 |
| 44493.5625 | 1.88 |
| 44493.572916666664 | 1.31 |
| 44493.583333333336 | 1.8 |
| 44493.59375 | 1.71 |
| 44493.604166666664 | 1.9 |
| 44493.614583333336 | 1.91 |
| 44493.625 | 1.84 |
| 44493.635416666664 | 1.78 |
| 44493.645833333336 | 1.51 |
| 44493.65625 | 1.3 |
| 44493.666666666664 | 1.51 |
| 44493.677083333336 | 1.43 |
| 44493.6875 | 1.35 |
| 44493.697916666664 | 1.41 |
| 44493.708333333336 | 1.16 |
| 44493.71875 | 1.65 |
| 44493.729166666664 | 1.33 |
| 44493.739583333336 | 1.63 |
| 44493.75 | 1.4 |
| 44493.760416666664 | 1.66 |
| 44493.770833333336 | 1.67 |
| 44493.78125 | 2.05 |
| 44493.791666666664 | 1.99 |
| 44493.802083333336 | 1.64 |
| 44493.8125 | 1.77 |
| 44493.822916666664 | 2.15 |
| 44493.833333333336 | 2.15 |
| 44493.84375 | 2.05 |
| 44493.854166666664 | 2.08 |
| 44493.864583333336 | 2.32 |
| 44493.875 | 2.18 |
| 44493.885416666664 | 2.2 |
| 44493.895833333336 | 2.44 |
| 44493.90625 | 2.4 |
| 44493.916666666664 | 2.67 |
| 44493.927083333336 | 2.51 |
| 44493.9375 | 2.15 |
| 44493.947916666664 | 1.87 |
| 44493.958333333336 | 2.15 |
| 44493.96875 | 2.06 |
| 44493.979166666664 | 2 |
| 44493.989583333336 | 1.91 |
| 44494.0 | 1.68 |
| 44494.010416666664 | 2.15 |
| 44494.020833333336 | 1.93 |
| 44494.03125 | 1.71 |
| 44494.041666666664 | 1.62 |
| 44494.052083333336 | 1.51 |
| 44494.0625 | 1.67 |
| 44494.072916666664 | 2.18 |
| 44494.083333333336 | 1.6 |
| 44494.09375 | 1.47 |
| 44494.104166666664 | 1.58 |
| 44494.114583333336 | 1.77 |
| 44494.125 | 1.71 |
| 44494.135416666664 | 1.66 |
| 44494.145833333336 | 1.93 |
| 44494.15625 | 1.65 |
| 44494.166666666664 | 1.91 |
| 44494.177083333336 | 2.13 |
| 44494.1875 | 1.99 |
| 44494.197916666664 | 1.9 |
| 44494.208333333336 | 1.61 |
| 44494.21875 | 1.71 |
| 44494.229166666664 | 1.87 |
| 44494.239583333336 | 1.73 |
| 44494.25 | 1.58 |
| 44494.260416666664 | 1.71 |
| 44494.270833333336 | 1.94 |
| 44494.28125 | 2.22 |
| 44494.291666666664 | 1.91 |
| 44494.302083333336 | 2.01 |
| 44494.3125 | 1.81 |
| 44494.322916666664 | 1.74 |
| 44494.333333333336 | 1.88 |
| 44494.34375 | 1.98 |
| 44494.354166666664 | 1.62 |
| 44494.364583333336 | 1.93 |
| 44494.375 | 1.73 |
| 44494.385416666664 | 1.72 |
| 44494.395833333336 | 1.84 |
| 44494.40625 | 1.81 |
| 44494.416666666664 | 2.03 |
| 44494.427083333336 | 1.94 |
| 44494.4375 | 2.03 |
| 44494.447916666664 | 1.85 |
| 44494.458333333336 | 1.81 |
| 44494.46875 | 1.78 |
| 44494.479166666664 | 1.47 |
| 44494.489583333336 | 1.74 |
| 44494.5 | 1.46 |
| 44494.510416666664 | 1.42 |
| 44494.520833333336 | 1.49 |
| 44494.53125 | 1.65 |
| 44494.541666666664 | 1.54 |
| 44494.552083333336 | 1.76 |
| 44494.5625 | 1.56 |
| 44494.572916666664 | 1.64 |
| 44494.583333333336 | 1.61 |
| 44494.59375 | 1.49 |
| 44494.604166666664 | 1.59 |
| 44494.614583333336 | 1.79 |
| 44494.625 | 1.38 |
| 44494.635416666664 | 1.43 |
| 44494.645833333336 | 1.68 |
| 44494.65625 | 1.72 |
| 44494.666666666664 | 1.43 |
| 44494.677083333336 | 1.92 |
| 44494.6875 | 1.79 |
| 44494.697916666664 | 1.46 |
| 44494.708333333336 | 1.72 |
| 44494.71875 | 1.83 |
| 44494.729166666664 | 2.66 |
| 44494.739583333336 | 2.17 |
| 44494.75 | 2.2 |
| 44494.760416666664 | 1.87 |
| 44494.770833333336 | 2.2 |
| 44494.78125 | 2.17 |
| 44494.791666666664 | 2.06 |
| 44494.802083333336 | 2.2 |
| 44494.8125 | 2.22 |
| 44494.822916666664 | 2.11 |
| 44494.833333333336 | 2.36 |
| 44494.84375 | 2.15 |
| 44494.854166666664 | 2.25 |
| 44494.864583333336 | 2.4 |
| 44494.875 | 2.57 |
| 44494.885416666664 | 2.83 |
| 44494.895833333336 | 2.55 |
| 44494.90625 | 2.43 |
| 44494.916666666664 | 2.58 |
| 44494.927083333336 | 2.93 |
| 44494.9375 | 2.64 |
| 44494.947916666664 | 3.48 |
| 44494.958333333336 | 2.74 |
| 44494.96875 | 2.51 |
| 44494.979166666664 | 2.72 |
| 44494.989583333336 | 2.18 |
| 44495.0 | 2.21 |
| 44495.010416666664 | 2.2 |
| 44495.020833333336 | 1.64 |
| 44495.03125 | 2.02 |
| 44495.041666666664 | 1.88 |
| 44495.052083333336 | 2.05 |
| 44495.0625 | 1.93 |
| 44495.072916666664 | 1.87 |
| 44495.083333333336 | 1.6 |
| 44495.09375 | 1.59 |
| 44495.104166666664 | 1.76 |
| 44495.114583333336 | 1.67 |
| 44495.125 | 1.59 |
| 44495.135416666664 | 1.88 |
| 44495.145833333336 | 1.81 |
| 44495.15625 | 2.03 |
| 44495.166666666664 | 1.78 |
| 44495.177083333336 | 1.8 |
| 44495.1875 | 2.16 |
| 44495.197916666664 | 1.96 |
| 44495.208333333336 | 1.98 |
| 44495.21875 | 2.08 |
| 44495.229166666664 | 1.94 |
| 44495.239583333336 | 1.37 |
| 44495.25 | 1.73 |
| 44495.260416666664 | 1.84 |
| 44495.270833333336 | 2.48 |
| 44495.28125 | 2.19 |
| 44495.291666666664 | 2.27 |
| 44495.302083333336 | 2.23 |
| 44495.3125 | 1.7 |
| 44495.322916666664 | 2.28 |
| 44495.333333333336 | 2.06 |
| 44495.34375 | 1.91 |
| 44495.354166666664 | 1.98 |
| 44495.364583333336 | 1.95 |
| 44495.375 | 1.92 |
| 44495.385416666664 | 2.05 |
| 44495.395833333336 | 2.03 |
| 44495.40625 | 1.77 |
| 44495.416666666664 | 2.06 |
| 44495.427083333336 | 1.74 |
| 44495.4375 | 1.73 |
| 44495.447916666664 | 1.74 |
| 44495.458333333336 | 2.07 |
| 44495.46875 | 1.88 |
| 44495.479166666664 | 2.07 |
| 44495.489583333336 | 1.97 |
| 44495.5 | 1.31 |
| 44495.510416666664 | 1.61 |
| 44495.520833333336 | 1.45 |
| 44495.53125 | 1.47 |
| 44495.541666666664 | 1.53 |
| 44495.552083333336 | 1.53 |
| 44495.5625 | 1.72 |
| 44495.572916666664 | 1.98 |
| 44495.583333333336 | 1.65 |
| 44495.59375 | 1.63 |
| 44495.604166666664 | 1.77 |
| 44495.614583333336 | 1.75 |
| 44495.625 | 1.31 |
| 44495.635416666664 | 1.73 |
| 44495.645833333336 | 1.48 |
| 44495.65625 | 1.22 |
| 44495.666666666664 | 1.53 |
| 44495.677083333336 | 1.18 |
| 44495.6875 | 1.42 |
| 44495.697916666664 | 1.23 |
| 44495.708333333336 | 1.31 |
| 44495.71875 | 1.33 |
| 44495.729166666664 | 1.63 |
| 44495.739583333336 | 1.7 |
| 44495.75 | 2.1 |
| 44495.760416666664 | 1.62 |
| 44495.770833333336 | 1.84 |
| 44495.78125 | 1.88 |
| 44495.791666666664 | 2.04 |
| 44495.802083333336 | 2.41 |
| 44495.8125 | 1.99 |
| 44495.822916666664 | 2.12 |
| 44495.833333333336 | 2.22 |
| 44495.84375 | 2.55 |
| 44495.854166666664 | 1.86 |
| 44495.864583333336 | 1.9 |
| 44495.875 | 2.08 |
| 44495.885416666664 | 1.66 |
| 44495.895833333336 | 2.08 |
| 44495.90625 | 2.33 |
| 44495.916666666664 | 2.03 |
| 44495.927083333336 | 2.25 |
| 44495.9375 | 2.28 |
| 44495.947916666664 | 2.38 |
| 44495.958333333336 | 2.65 |
| 44495.96875 | 2.98 |
| 44495.979166666664 | 2.5 |
| 44495.989583333336 | 2.42 |
| 44496.0 | 2.53 |
| 44496.010416666664 | 2.49 |
| 44496.020833333336 | 1.94 |
| 44496.03125 | 2.1 |
| 44496.041666666664 | 2.09 |
| 44496.052083333336 | 2.14 |
| 44496.0625 | 1.82 |
| 44496.072916666664 | 1.72 |
| 44496.083333333336 | 1.92 |
| 44496.09375 | 2.21 |
| 44496.104166666664 | 2.16 |
| 44496.114583333336 | 2.13 |
| 44496.125 | 2.06 |
| 44496.135416666664 | 2.24 |
| 44496.145833333336 | 1.92 |
| 44496.15625 | 1.99 |
| 44496.166666666664 | 2.06 |
| 44496.177083333336 | 2.49 |
| 44496.1875 | 2.17 |
| 44496.197916666664 | 2.35 |
| 44496.208333333336 | 2.71 |
| 44496.21875 | 2.46 |
| 44496.229166666664 | 1.98 |
| 44496.239583333336 | 2.41 |
| 44496.25 | 2.74 |
| 44496.260416666664 | 2.85 |
| 44496.270833333336 | 2.23 |
| 44496.28125 | 2.47 |
| 44496.291666666664 | 2.63 |
| 44496.302083333336 | 2.31 |
| 44496.3125 | 2.42 |
| 44496.322916666664 | 2.17 |
| 44496.333333333336 | 2.13 |
| 44496.34375 | 2.21 |
| 44496.354166666664 | 2.43 |
| 44496.364583333336 | 2.13 |
| 44496.375 | 2.07 |
| 44496.385416666664 | 1.89 |
| 44496.395833333336 | 2.04 |
| 44496.40625 | 1.9 |
| 44496.416666666664 | 1.81 |
| 44496.427083333336 | 2.59 |
| 44496.4375 | 2.33 |
| 44496.447916666664 | 2.33 |
| 44496.458333333336 | 2.21 |
| 44496.46875 | 2.36 |
| 44496.479166666664 | 2.36 |
| 44496.489583333336 | 1.75 |
| 44496.5 | 1.93 |
| 44496.510416666664 | 1.77 |
| 44496.520833333336 | 2.01 |
| 44496.53125 | 2.06 |
| 44496.541666666664 | 1.91 |
| 44496.552083333336 | 2.32 |
| 44496.5625 | 2.04 |
| 44496.572916666664 | 2.02 |
| 44496.583333333336 | 1.74 |
| 44496.59375 | 1.92 |
| 44496.604166666664 | 1.86 |
| 44496.614583333336 | 1.53 |
| 44496.625 | 1.49 |
| 44496.635416666664 | 1.38 |
| 44496.645833333336 | 1.3 |
| 44496.65625 | 1.42 |
| 44496.666666666664 | 1.5 |
| 44496.677083333336 | 1.69 |
| 44496.6875 | 1.64 |
| 44496.697916666664 | 1.51 |
| 44496.708333333336 | 1.78 |
| 44496.71875 | 1.83 |
| 44496.729166666664 | 2.07 |
| 44496.739583333336 | 2.47 |
| 44496.75 | 2.35 |
| 44496.760416666664 | 2.56 |
| 44496.770833333336 | 2.16 |
| 44496.78125 | 1.66 |
| 44496.791666666664 | 2.79 |
| 44496.802083333336 | 2.24 |
| 44496.8125 | 2.45 |
| 44496.822916666664 | 2.12 |
| 44496.833333333336 | 2.32 |
| 44496.84375 | 2.08 |
| 44496.854166666664 | 2.04 |
| 44496.864583333336 | 1.97 |
| 44496.875 | 2.62 |
| 44496.885416666664 | 2.56 |
| 44496.895833333336 | 2.6 |
| 44496.90625 | 2.32 |
| 44496.916666666664 | 2.41 |
| 44496.927083333336 | 2.69 |
| 44496.9375 | 2.42 |
| 44496.947916666664 | 2.78 |
| 44496.958333333336 | 3.1 |
| 44496.96875 | 2.68 |
| 44496.979166666664 | 2.77 |
| 44496.989583333336 | 2.79 |
| 44497.0 | 2.98 |
| 44497.010416666664 | 2.53 |
| 44497.020833333336 | 3.48 |
| 44497.03125 | 3.03 |
| 44497.041666666664 | 3.29 |
| 44497.052083333336 | 3.09 |
| 44497.0625 | 2.15 |
| 44497.072916666664 | 2 |
| 44497.083333333336 | 2.15 |
| 44497.09375 | 1.72 |
| 44497.104166666664 | 2.01 |
| 44497.114583333336 | 1.77 |
| 44497.125 | 1.88 |
| 44497.135416666664 | 2.32 |
| 44497.145833333336 | 1.9 |
| 44497.15625 | 1.77 |
| 44497.166666666664 | 1.7 |
| 44497.177083333336 | 1.87 |
| 44497.1875 | 1.97 |
| 44497.197916666664 | 2.04 |
| 44497.208333333336 | 1.69 |
| 44497.21875 | 1.81 |
| 44497.229166666664 | 2.08 |
| 44497.239583333336 | 1.94 |
| 44497.25 | 1.92 |
| 44497.260416666664 | 2.13 |
| 44497.270833333336 | 1.96 |
| 44497.28125 | 1.97 |
| 44497.291666666664 | 2.08 |
| 44497.302083333336 | 1.73 |
| 44497.3125 | 2.04 |
| 44497.322916666664 | 2.06 |
| 44497.333333333336 | 1.89 |
| 44497.34375 | 2.16 |
| 44497.354166666664 | 1.75 |
| 44497.364583333336 | 1.81 |
| 44497.375 | 2.07 |
| 44497.385416666664 | 1.76 |
| 44497.395833333336 | 1.98 |
| 44497.40625 | 2.13 |
| 44497.416666666664 | 1.93 |
| 44497.427083333336 | 1.6 |
| 44497.4375 | 1.96 |
| 44497.447916666664 | 1.88 |
| 44497.458333333336 | 1.81 |
| 44497.46875 | 2.17 |
| 44497.479166666664 | 1.84 |
| 44497.489583333336 | 1.82 |
| 44497.5 | 2.13 |
| 44497.510416666664 | 2.11 |
| 44497.520833333336 | 2.07 |
| 44497.53125 | 1.85 |
| 44497.541666666664 | 1.74 |
| 44497.552083333336 | 1.39 |
| 44497.5625 | 1.45 |
| 44497.572916666664 | 1.62 |
| 44497.583333333336 | 1.63 |
| 44497.59375 | 1.49 |
| 44497.604166666664 | 1.5 |
| 44497.614583333336 | 1.49 |
| 44497.625 | 1.57 |
| 44497.635416666664 | 1.69 |
| 44497.645833333336 | 1.6 |
| 44497.65625 | 1.62 |
| 44497.666666666664 | 1.63 |
| 44497.677083333336 | 1.46 |
| 44497.6875 | 1.4 |
| 44497.697916666664 | 1.3 |
| 44497.708333333336 | 1.73 |
| 44497.71875 | 1.69 |
| 44497.729166666664 | 1.76 |
| 44497.739583333336 | 1.68 |
| 44497.75 | 1.44 |
| 44497.760416666664 | 1.58 |
| 44497.770833333336 | 1.5 |
| 44497.78125 | 1.42 |
| 44497.791666666664 | 1.54 |
| 44497.802083333336 | 1.64 |
| 44497.8125 | 2.24 |
| 44497.822916666664 | 2.43 |
| 44497.833333333336 | 2.19 |
| 44497.84375 | 2.35 |
| 44497.854166666664 | 2.12 |
| 44497.864583333336 | 1.84 |
| 44497.875 | 1.75 |
| 44497.885416666664 | 2.03 |
| 44497.895833333336 | 2.03 |
| 44497.90625 | 2 |
| 44497.916666666664 | 2.1 |
| 44497.927083333336 | 1.98 |
| 44497.9375 | 2.36 |
| 44497.947916666664 | 2.51 |
| 44497.958333333336 | 2.75 |
| 44497.96875 | 2.36 |
| 44497.979166666664 | 2.25 |
| 44497.989583333336 | 2.28 |
| 44498.0 | 2.15 |
| 44498.010416666664 | 2.35 |
| 44498.020833333336 | 2.03 |
| 44498.03125 | 2.34 |
| 44498.041666666664 | 2.23 |
| 44498.052083333336 | 2.23 |
| 44498.0625 | 2.33 |
| 44498.072916666664 | 2.4 |
| 44498.083333333336 | 1.95 |
| 44498.09375 | 2.34 |
| 44498.104166666664 | 2.52 |
| 44498.114583333336 | 2.3 |
| 44498.125 | 1.77 |
| 44498.135416666664 | 1.96 |
| 44498.145833333336 | 1.83 |
| 44498.15625 | 2.18 |
| 44498.166666666664 | 1.87 |
| 44498.177083333336 | 1.81 |
| 44498.1875 | 1.65 |
| 44498.197916666664 | 1.69 |
| 44498.208333333336 | 1.57 |
| 44498.21875 | 1.68 |
| 44498.229166666664 | 1.73 |
| 44498.239583333336 | 1.55 |
| 44498.25 | 1.65 |
| 44498.260416666664 | 1.65 |
| 44498.270833333336 | 1.36 |
| 44498.28125 | 1.9 |
| 44498.291666666664 | 1.89 |
| 44498.302083333336 | 1.79 |
| 44498.3125 | 1.87 |
| 44498.322916666664 | 1.88 |
| 44498.333333333336 | 1.76 |
| 44498.34375 | 1.75 |
| 44498.354166666664 | 1.84 |
| 44498.364583333336 | 1.74 |
| 44498.375 | 1.56 |
| 44498.385416666664 | 1.87 |
| 44498.395833333336 | 1.9 |
| 44498.40625 | 1.88 |
| 44498.416666666664 | 1.93 |
| 44498.427083333336 | 1.79 |
| 44498.4375 | 1.88 |
| 44498.447916666664 | 1.88 |
| 44498.458333333336 | 1.83 |
| 44498.46875 | 1.78 |
| 44498.479166666664 | 1.83 |
| 44498.489583333336 | 1.59 |
| 44498.5 | 1.78 |
| 44498.510416666664 | 2.04 |
| 44498.520833333336 | 1.89 |
| 44498.53125 | 2.01 |
| 44498.541666666664 | 1.76 |
| 44498.552083333336 | 2.18 |
| 44498.5625 | 2.15 |
| 44498.572916666664 | 2.29 |
| 44498.583333333336 | 1.95 |
| 44498.59375 | 1.97 |
| 44498.604166666664 | 2.17 |
| 44498.614583333336 | 2.06 |
| 44498.625 | 1.79 |
| 44498.635416666664 | 2.04 |
| 44498.645833333336 | 2.11 |
| 44498.65625 | 1.98 |
| 44498.666666666664 | 2.07 |
| 44498.677083333336 | 2.05 |
| 44498.6875 | 2.12 |
| 44498.697916666664 | 1.88 |
| 44498.708333333336 | 2 |
| 44498.71875 | 2.7 |
| 44498.729166666664 | 2.43 |
| 44498.739583333336 | 2.73 |
| 44498.75 | 3.11 |
| 44498.760416666664 | 2.88 |
| 44498.770833333336 | 2.9 |
| 44498.78125 | 2.81 |
| 44498.791666666664 | 2.87 |
| 44498.802083333336 | 3.15 |
| 44498.8125 | 2.93 |
| 44498.822916666664 | 3.09 |
| 44498.833333333336 | 2.98 |
| 44498.84375 | 2.6 |
| 44498.854166666664 | 2.27 |
| 44498.864583333336 | 2.53 |
| 44498.875 | 2.27 |
| 44498.885416666664 | 1.84 |
| 44498.895833333336 | 2.19 |
| 44498.90625 | 2.28 |
| 44498.916666666664 | 2.16 |
| 44498.927083333336 | 2.25 |
| 44498.9375 | 2.67 |
| 44498.947916666664 | 2.82 |
| 44498.958333333336 | 3.06 |
| 44498.96875 | 3.22 |
| 44498.979166666664 | 3.27 |
| 44498.989583333336 | 2.78 |
| 44499.0 | 2.88 |
| 44499.010416666664 | 2.98 |
| 44499.020833333336 | 2.97 |
| 44499.03125 | 2.95 |
| 44499.041666666664 | 2.45 |
| 44499.052083333336 | 2.93 |
| 44499.0625 | 3 |
| 44499.072916666664 | 2.96 |
| 44499.083333333336 | 3.55 |
| 44499.09375 | 3.44 |
| 44499.104166666664 | 3.26 |
| 44499.114583333336 | 2.82 |
| 44499.125 | 2.79 |
| 44499.135416666664 | 2.41 |
| 44499.145833333336 | 2.14 |
| 44499.15625 | 2.44 |
| 44499.166666666664 | 2.22 |
| 44499.177083333336 | 2.04 |
| 44499.1875 | 2.1 |
| 44499.197916666664 | 2.31 |
| 44499.208333333336 | 2.1 |
| 44499.21875 | 2.24 |
| 44499.229166666664 | 2.43 |
| 44499.239583333336 | 2.45 |
| 44499.25 | 2.78 |
| 44499.260416666664 | 2.66 |
| 44499.270833333336 | 2.37 |
| 44499.28125 | 2.63 |
| 44499.291666666664 | 2.31 |
| 44499.302083333336 | 2.43 |
| 44499.3125 | 2.44 |
| 44499.322916666664 | 2.53 |
| 44499.333333333336 | 2.51 |
| 44499.34375 | 2.43 |
| 44499.354166666664 | 2.59 |
| 44499.364583333336 | 2.3 |
| 44499.375 | 2.6 |
| 44499.385416666664 | 2.42 |
| 44499.395833333336 | 2.34 |
| 44499.40625 | 1.99 |
| 44499.416666666664 | 2.26 |
| 44499.427083333336 | 1.84 |
| 44499.4375 | 1.7 |
| 44499.447916666664 | 1.81 |
| 44499.458333333336 | 1.95 |
| 44499.46875 | 2.07 |
| 44499.479166666664 | 1.98 |
| 44499.489583333336 | 1.92 |
| 44499.5 | 1.97 |
| 44499.510416666664 | 2.04 |
| 44499.520833333336 | 2.07 |
| 44499.53125 | 2.25 |
| 44499.541666666664 | 2.23 |
| 44499.552083333336 | 2.28 |
| 44499.5625 | 2.11 |
| 44499.572916666664 | 1.95 |
| 44499.583333333336 | 2.02 |
| 44499.59375 | 2.28 |
| 44499.604166666664 | 2.02 |
| 44499.614583333336 | 1.6 |
| 44499.625 | 1.99 |
| 44499.635416666664 | 1.51 |
| 44499.645833333336 | 1.46 |
| 44499.65625 | 1.39 |
| 44499.666666666664 | 1.3 |
| 44499.677083333336 | 1.28 |
| 44499.6875 | 1.38 |
| 44499.697916666664 | 1.43 |
| 44499.708333333336 | 1.81 |
| 44499.71875 | 1.84 |
| 44499.729166666664 | 1.52 |
| 44499.739583333336 | 1.71 |
| 44499.75 | 1.69 |
| 44499.760416666664 | 1.65 |
| 44499.770833333336 | 1.63 |
| 44499.78125 | 1.69 |
| 44499.791666666664 | 1.72 |
| 44499.802083333336 | 1.69 |
| 44499.8125 | 1.75 |
| 44499.822916666664 | 1.63 |
| 44499.833333333336 | 1.62 |
| 44499.84375 | 2 |
| 44499.854166666664 | 1.42 |
| 44499.864583333336 | 1.74 |
| 44499.875 | 2.11 |
| 44499.885416666664 | 1.89 |
| 44499.895833333336 | 2.11 |
| 44499.90625 | 2.21 |
| 44499.916666666664 | 1.71 |
| 44499.927083333336 | 2.01 |
| 44499.9375 | 2.39 |
| 44499.947916666664 | 2.19 |
| 44499.958333333336 | 2.4 |
| 44499.96875 | 2.53 |
| 44499.979166666664 | 2.65 |
| 44499.989583333336 | 2.52 |
| 44500.0 | 2.29 |
| 44500.010416666664 | 2.02 |
| 44500.020833333336 | 2.16 |
| 44500.03125 | 2.27 |
| 44500.041666666664 | 2.08 |
| 44500.052083333336 | 2.11 |
| 44500.0625 | 2.03 |
| 44500.072916666664 | 1.97 |
| 44500.083333333336 | 2.03 |
| 44500.09375 | 2.03 |
| 44500.104166666664 | 1.97 |
| 44500.114583333336 | 2.16 |
| 44500.125 | 2.27 |
| 44500.135416666664 | 2.3 |
| 44500.145833333336 | 2.2 |
| 44500.15625 | 2.47 |
| 44500.166666666664 | 1.86 |
| 44500.177083333336 | 2.49 |
| 44500.1875 | 1.68 |
| 44500.197916666664 | 1.87 |
| 44500.208333333336 | 1.79 |
| 44500.21875 | 1.93 |
| 44500.229166666664 | 2.03 |
| 44500.239583333336 | 1.72 |
| 44500.25 | 1.59 |
| 44500.260416666664 | 1.8 |
| 44500.270833333336 | 1.38 |
| 44500.28125 | 1.58 |
| 44500.291666666664 | 1.74 |
| 44500.302083333336 | 1.9 |
| 44500.3125 | 1.7 |
| 44500.322916666664 | 1.97 |
| 44500.333333333336 | 1.82 |
| 44500.34375 | 1.62 |
| 44500.354166666664 | 1.6 |
| 44500.364583333336 | 1.47 |
| 44500.375 | 1.64 |
| 44500.385416666664 | 1.66 |
| 44500.395833333336 | 1.96 |
| 44500.40625 | 1.89 |
| 44500.416666666664 | 1.74 |
| 44500.427083333336 | 2.39 |
| 44500.4375 | 1.85 |
| 44500.447916666664 | 1.5 |
| 44500.458333333336 | 1.64 |
| 44500.46875 | 1.66 |
| 44500.479166666664 | 2.03 |
| 44500.489583333336 | 1.78 |
| 44500.5 | 1.38 |
| 44500.510416666664 | 1.54 |
| 44500.520833333336 | 1.61 |
| 44500.53125 | 1.92 |
| 44500.541666666664 | 1.87 |
| 44500.552083333336 | 1.83 |
| 44500.5625 | 1.8 |
| 44500.572916666664 | 1.95 |
| 44500.583333333336 | 1.93 |
| 44500.59375 | 1.9 |
| 44500.604166666664 | 1.68 |
| 44500.614583333336 | 1.73 |
| 44500.625 | 2.1 |
| 44500.635416666664 | 2.13 |
| 44500.645833333336 | 2.66 |
| 44500.65625 | 2.34 |
| 44500.666666666664 | 1.97 |
| 44500.677083333336 | 1.67 |
| 44500.6875 | 1.42 |
| 44500.697916666664 | 1.62 |
| 44500.708333333336 | 1.4 |
| 44500.71875 | 1.57 |
| 44500.729166666664 | 1.71 |
| 44500.739583333336 | 1.38 |
| 44500.75 | 1.42 |
| 44500.760416666664 | 1.33 |
| 44500.770833333336 | 1.39 |
| 44500.78125 | 1.61 |
| 44500.791666666664 | 1.43 |
| 44500.802083333336 | 1.62 |
| 44500.8125 | 1.63 |
| 44500.822916666664 | 1.48 |
| 44500.833333333336 | 1.53 |
| 44500.84375 | 1.33 |
| 44500.854166666664 | 1.12 |
| 44500.864583333336 | 1.53 |
| 44500.875 | 1.29 |
| 44500.885416666664 | 1.43 |
| 44500.895833333336 | 1.44 |
| 44500.90625 | 1.91 |
| 44500.916666666664 | 1.48 |
| 44500.927083333336 | 1.65 |
| 44500.9375 | 2.16 |
| 44500.947916666664 | 1.91 |
| 44500.958333333336 | 1.86 |
| 44500.96875 | 2.17 |
| 44500.979166666664 | 2.17 |
| 44500.989583333336 | 2.14 |
| 44501.0 | 1.8 |
| 44501.010416666664 | 2.03 |
| 44501.020833333336 | 1.92 |
| 44501.03125 | 1.74 |
| 44501.041666666664 | 2.02 |
| 44501.052083333336 | 2.06 |
| 44501.0625 | 2.17 |
| 44501.072916666664 | 1.95 |
| 44501.083333333336 | 1.9 |
| 44501.09375 | 2.26 |
| 44501.104166666664 | 2.11 |
| 44501.114583333336 | 2.62 |
| 44501.125 | 2.31 |
| 44501.135416666664 | 2.21 |
| 44501.145833333336 | 2.44 |
| 44501.15625 | 2.09 |